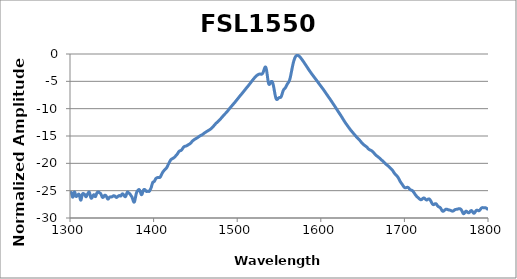
| Category | Normalized Amplitude (dB) |
|---|---|
| 1300.055786 | -25.632 |
| 1300.13855 | -25.602 |
| 1300.221313 | -25.572 |
| 1300.304199 | -25.54 |
| 1300.386963 | -25.508 |
| 1300.469849 | -25.476 |
| 1300.552734 | -25.446 |
| 1300.63562 | -25.418 |
| 1300.718506 | -25.392 |
| 1300.801392 | -25.369 |
| 1300.884277 | -25.35 |
| 1300.967163 | -25.335 |
| 1301.050049 | -25.324 |
| 1301.132935 | -25.319 |
| 1301.215942 | -25.319 |
| 1301.298828 | -25.324 |
| 1301.381836 | -25.335 |
| 1301.464844 | -25.351 |
| 1301.547852 | -25.373 |
| 1301.630859 | -25.401 |
| 1301.713867 | -25.434 |
| 1301.796875 | -25.471 |
| 1301.879883 | -25.513 |
| 1301.962891 | -25.559 |
| 1302.046021 | -25.608 |
| 1302.129028 | -25.66 |
| 1302.212158 | -25.713 |
| 1302.295166 | -25.768 |
| 1302.378296 | -25.823 |
| 1302.461304 | -25.877 |
| 1302.544434 | -25.929 |
| 1302.627563 | -25.979 |
| 1302.710693 | -26.025 |
| 1302.793823 | -26.067 |
| 1302.876953 | -26.103 |
| 1302.960205 | -26.134 |
| 1303.043335 | -26.158 |
| 1303.126465 | -26.175 |
| 1303.209839 | -26.185 |
| 1303.293091 | -26.187 |
| 1303.376343 | -26.181 |
| 1303.459473 | -26.168 |
| 1303.542725 | -26.148 |
| 1303.625977 | -26.121 |
| 1303.709229 | -26.087 |
| 1303.79248 | -26.047 |
| 1303.875854 | -26.003 |
| 1303.959106 | -25.954 |
| 1304.042358 | -25.902 |
| 1304.125732 | -25.847 |
| 1304.208984 | -25.79 |
| 1304.292358 | -25.732 |
| 1304.375732 | -25.675 |
| 1304.459106 | -25.618 |
| 1304.542358 | -25.563 |
| 1304.625732 | -25.511 |
| 1304.709229 | -25.462 |
| 1304.792603 | -25.416 |
| 1304.875977 | -25.375 |
| 1304.959473 | -25.339 |
| 1305.042847 | -25.309 |
| 1305.126343 | -25.284 |
| 1305.209839 | -25.265 |
| 1305.293213 | -25.253 |
| 1305.376709 | -25.247 |
| 1305.460205 | -25.248 |
| 1305.543701 | -25.256 |
| 1305.627197 | -25.27 |
| 1305.710693 | -25.29 |
| 1305.794189 | -25.317 |
| 1305.877808 | -25.349 |
| 1305.961304 | -25.386 |
| 1306.044922 | -25.427 |
| 1306.128418 | -25.473 |
| 1306.212036 | -25.521 |
| 1306.295654 | -25.572 |
| 1306.37915 | -25.625 |
| 1306.462769 | -25.677 |
| 1306.546387 | -25.73 |
| 1306.630005 | -25.78 |
| 1306.713745 | -25.829 |
| 1306.797485 | -25.874 |
| 1306.881104 | -25.916 |
| 1306.964722 | -25.953 |
| 1307.048462 | -25.985 |
| 1307.132202 | -26.012 |
| 1307.21582 | -26.033 |
| 1307.299561 | -26.048 |
| 1307.383301 | -26.059 |
| 1307.467041 | -26.064 |
| 1307.550781 | -26.065 |
| 1307.634521 | -26.062 |
| 1307.718262 | -26.055 |
| 1307.802124 | -26.046 |
| 1307.885864 | -26.035 |
| 1307.969727 | -26.022 |
| 1308.053467 | -26.008 |
| 1308.137329 | -25.994 |
| 1308.221191 | -25.98 |
| 1308.305054 | -25.966 |
| 1308.388916 | -25.953 |
| 1308.472778 | -25.941 |
| 1308.556641 | -25.929 |
| 1308.640625 | -25.918 |
| 1308.724487 | -25.908 |
| 1308.80835 | -25.898 |
| 1308.892334 | -25.887 |
| 1308.976196 | -25.877 |
| 1309.060181 | -25.866 |
| 1309.144165 | -25.854 |
| 1309.228027 | -25.841 |
| 1309.312012 | -25.827 |
| 1309.395996 | -25.812 |
| 1309.47998 | -25.796 |
| 1309.564087 | -25.779 |
| 1309.648071 | -25.761 |
| 1309.732056 | -25.742 |
| 1309.816162 | -25.724 |
| 1309.900146 | -25.705 |
| 1309.984253 | -25.688 |
| 1310.068359 | -25.672 |
| 1310.152466 | -25.658 |
| 1310.236572 | -25.646 |
| 1310.320679 | -25.637 |
| 1310.404785 | -25.632 |
| 1310.488892 | -25.63 |
| 1310.572998 | -25.633 |
| 1310.657227 | -25.641 |
| 1310.741333 | -25.653 |
| 1310.825562 | -25.671 |
| 1310.909668 | -25.693 |
| 1310.993896 | -25.721 |
| 1311.078125 | -25.754 |
| 1311.162354 | -25.792 |
| 1311.24646 | -25.835 |
| 1311.330811 | -25.882 |
| 1311.415039 | -25.933 |
| 1311.499268 | -25.987 |
| 1311.583496 | -26.045 |
| 1311.667847 | -26.105 |
| 1311.752075 | -26.166 |
| 1311.836426 | -26.228 |
| 1311.920776 | -26.291 |
| 1312.005127 | -26.352 |
| 1312.089478 | -26.412 |
| 1312.173706 | -26.469 |
| 1312.258057 | -26.523 |
| 1312.342529 | -26.572 |
| 1312.42688 | -26.615 |
| 1312.51123 | -26.653 |
| 1312.595581 | -26.684 |
| 1312.680054 | -26.708 |
| 1312.764404 | -26.724 |
| 1312.848877 | -26.732 |
| 1312.93335 | -26.731 |
| 1313.017822 | -26.722 |
| 1313.102295 | -26.705 |
| 1313.186768 | -26.68 |
| 1313.27124 | -26.648 |
| 1313.355713 | -26.609 |
| 1313.440186 | -26.564 |
| 1313.524658 | -26.514 |
| 1313.609375 | -26.459 |
| 1313.693848 | -26.401 |
| 1313.778442 | -26.34 |
| 1313.862915 | -26.277 |
| 1313.94751 | -26.213 |
| 1314.032104 | -26.15 |
| 1314.116699 | -26.087 |
| 1314.201416 | -26.026 |
| 1314.286011 | -25.967 |
| 1314.370605 | -25.91 |
| 1314.4552 | -25.856 |
| 1314.539917 | -25.806 |
| 1314.624512 | -25.76 |
| 1314.709229 | -25.718 |
| 1314.793945 | -25.68 |
| 1314.87854 | -25.646 |
| 1314.963257 | -25.617 |
| 1315.047974 | -25.592 |
| 1315.13269 | -25.57 |
| 1315.217407 | -25.553 |
| 1315.302246 | -25.539 |
| 1315.387085 | -25.529 |
| 1315.471802 | -25.522 |
| 1315.556641 | -25.518 |
| 1315.641357 | -25.516 |
| 1315.726196 | -25.517 |
| 1315.811035 | -25.519 |
| 1315.895752 | -25.522 |
| 1315.980591 | -25.527 |
| 1316.06543 | -25.533 |
| 1316.150391 | -25.539 |
| 1316.235229 | -25.546 |
| 1316.320068 | -25.552 |
| 1316.404907 | -25.56 |
| 1316.489868 | -25.567 |
| 1316.574707 | -25.574 |
| 1316.659668 | -25.582 |
| 1316.744629 | -25.589 |
| 1316.82959 | -25.598 |
| 1316.914551 | -25.606 |
| 1316.999512 | -25.616 |
| 1317.084473 | -25.627 |
| 1317.169556 | -25.639 |
| 1317.254517 | -25.652 |
| 1317.339478 | -25.667 |
| 1317.424561 | -25.683 |
| 1317.509521 | -25.702 |
| 1317.594604 | -25.722 |
| 1317.679688 | -25.744 |
| 1317.764771 | -25.767 |
| 1317.849731 | -25.792 |
| 1317.934814 | -25.819 |
| 1318.02002 | -25.846 |
| 1318.105103 | -25.875 |
| 1318.190186 | -25.903 |
| 1318.275269 | -25.932 |
| 1318.360474 | -25.96 |
| 1318.445557 | -25.987 |
| 1318.530762 | -26.012 |
| 1318.615967 | -26.035 |
| 1318.701172 | -26.056 |
| 1318.786255 | -26.075 |
| 1318.871582 | -26.09 |
| 1318.956787 | -26.101 |
| 1319.041992 | -26.108 |
| 1319.127319 | -26.112 |
| 1319.212524 | -26.112 |
| 1319.297852 | -26.107 |
| 1319.383057 | -26.099 |
| 1319.468384 | -26.087 |
| 1319.553589 | -26.071 |
| 1319.638916 | -26.052 |
| 1319.724243 | -26.031 |
| 1319.80957 | -26.007 |
| 1319.894897 | -25.981 |
| 1319.980225 | -25.953 |
| 1320.065674 | -25.924 |
| 1320.151001 | -25.895 |
| 1320.236328 | -25.865 |
| 1320.321777 | -25.835 |
| 1320.407227 | -25.806 |
| 1320.492554 | -25.777 |
| 1320.578003 | -25.748 |
| 1320.663574 | -25.721 |
| 1320.749023 | -25.694 |
| 1320.834473 | -25.668 |
| 1320.919922 | -25.643 |
| 1321.005371 | -25.619 |
| 1321.090942 | -25.595 |
| 1321.176392 | -25.572 |
| 1321.261841 | -25.549 |
| 1321.347412 | -25.526 |
| 1321.432983 | -25.504 |
| 1321.518555 | -25.481 |
| 1321.604004 | -25.458 |
| 1321.689575 | -25.436 |
| 1321.775269 | -25.413 |
| 1321.86084 | -25.391 |
| 1321.946411 | -25.37 |
| 1322.031982 | -25.349 |
| 1322.117676 | -25.329 |
| 1322.203247 | -25.311 |
| 1322.28894 | -25.294 |
| 1322.374634 | -25.28 |
| 1322.460327 | -25.269 |
| 1322.546021 | -25.261 |
| 1322.631714 | -25.256 |
| 1322.717407 | -25.255 |
| 1322.803101 | -25.259 |
| 1322.888794 | -25.266 |
| 1322.974609 | -25.279 |
| 1323.060303 | -25.296 |
| 1323.146118 | -25.318 |
| 1323.231812 | -25.344 |
| 1323.317627 | -25.375 |
| 1323.403442 | -25.411 |
| 1323.489258 | -25.45 |
| 1323.575073 | -25.493 |
| 1323.660889 | -25.54 |
| 1323.746704 | -25.589 |
| 1323.83252 | -25.641 |
| 1323.918457 | -25.695 |
| 1324.004272 | -25.75 |
| 1324.09021 | -25.805 |
| 1324.176147 | -25.861 |
| 1324.262085 | -25.917 |
| 1324.3479 | -25.971 |
| 1324.433838 | -26.023 |
| 1324.519775 | -26.074 |
| 1324.605713 | -26.122 |
| 1324.691772 | -26.166 |
| 1324.77771 | -26.208 |
| 1324.863647 | -26.245 |
| 1324.949707 | -26.279 |
| 1325.035645 | -26.308 |
| 1325.121704 | -26.333 |
| 1325.207764 | -26.353 |
| 1325.293823 | -26.369 |
| 1325.379883 | -26.381 |
| 1325.465942 | -26.388 |
| 1325.552002 | -26.391 |
| 1325.638062 | -26.39 |
| 1325.724121 | -26.386 |
| 1325.810303 | -26.378 |
| 1325.896362 | -26.368 |
| 1325.982666 | -26.354 |
| 1326.068726 | -26.338 |
| 1326.154907 | -26.32 |
| 1326.241089 | -26.299 |
| 1326.327271 | -26.277 |
| 1326.413452 | -26.254 |
| 1326.499634 | -26.229 |
| 1326.585815 | -26.203 |
| 1326.671997 | -26.177 |
| 1326.758301 | -26.149 |
| 1326.844482 | -26.121 |
| 1326.930786 | -26.093 |
| 1327.016968 | -26.064 |
| 1327.103271 | -26.036 |
| 1327.189575 | -26.008 |
| 1327.275879 | -25.98 |
| 1327.362183 | -25.952 |
| 1327.448486 | -25.925 |
| 1327.53479 | -25.899 |
| 1327.621094 | -25.875 |
| 1327.70752 | -25.852 |
| 1327.793945 | -25.83 |
| 1327.880249 | -25.811 |
| 1327.966675 | -25.794 |
| 1328.053101 | -25.779 |
| 1328.139526 | -25.767 |
| 1328.225952 | -25.757 |
| 1328.312378 | -25.751 |
| 1328.398804 | -25.748 |
| 1328.485229 | -25.748 |
| 1328.571655 | -25.751 |
| 1328.658203 | -25.757 |
| 1328.744629 | -25.767 |
| 1328.831177 | -25.78 |
| 1328.917603 | -25.796 |
| 1329.00415 | -25.814 |
| 1329.090698 | -25.835 |
| 1329.177246 | -25.858 |
| 1329.263794 | -25.882 |
| 1329.350342 | -25.908 |
| 1329.43689 | -25.934 |
| 1329.52356 | -25.96 |
| 1329.610229 | -25.985 |
| 1329.696777 | -26.009 |
| 1329.783447 | -26.031 |
| 1329.870117 | -26.05 |
| 1329.956665 | -26.067 |
| 1330.043335 | -26.079 |
| 1330.130005 | -26.087 |
| 1330.216675 | -26.091 |
| 1330.303345 | -26.09 |
| 1330.390137 | -26.084 |
| 1330.476807 | -26.073 |
| 1330.563477 | -26.058 |
| 1330.650269 | -26.037 |
| 1330.737061 | -26.013 |
| 1330.82373 | -25.984 |
| 1330.910522 | -25.952 |
| 1330.997314 | -25.918 |
| 1331.084106 | -25.881 |
| 1331.170898 | -25.843 |
| 1331.25769 | -25.803 |
| 1331.344604 | -25.764 |
| 1331.431396 | -25.724 |
| 1331.518311 | -25.685 |
| 1331.605103 | -25.646 |
| 1331.692017 | -25.609 |
| 1331.778931 | -25.574 |
| 1331.865845 | -25.54 |
| 1331.952759 | -25.507 |
| 1332.039673 | -25.477 |
| 1332.126587 | -25.449 |
| 1332.213501 | -25.423 |
| 1332.300415 | -25.399 |
| 1332.387329 | -25.376 |
| 1332.474365 | -25.356 |
| 1332.561279 | -25.337 |
| 1332.648315 | -25.32 |
| 1332.735352 | -25.305 |
| 1332.822388 | -25.291 |
| 1332.909424 | -25.279 |
| 1332.99646 | -25.268 |
| 1333.083496 | -25.258 |
| 1333.170654 | -25.25 |
| 1333.25769 | -25.243 |
| 1333.344727 | -25.237 |
| 1333.431885 | -25.233 |
| 1333.519043 | -25.23 |
| 1333.606079 | -25.228 |
| 1333.693237 | -25.227 |
| 1333.780396 | -25.227 |
| 1333.867554 | -25.228 |
| 1333.954712 | -25.23 |
| 1334.04187 | -25.233 |
| 1334.129028 | -25.236 |
| 1334.216309 | -25.241 |
| 1334.303467 | -25.247 |
| 1334.390747 | -25.254 |
| 1334.477905 | -25.261 |
| 1334.565186 | -25.27 |
| 1334.652466 | -25.279 |
| 1334.739746 | -25.289 |
| 1334.827026 | -25.299 |
| 1334.914307 | -25.311 |
| 1335.001587 | -25.322 |
| 1335.088989 | -25.335 |
| 1335.17627 | -25.347 |
| 1335.263672 | -25.36 |
| 1335.350952 | -25.373 |
| 1335.438354 | -25.386 |
| 1335.525635 | -25.399 |
| 1335.613037 | -25.411 |
| 1335.700439 | -25.424 |
| 1335.787842 | -25.436 |
| 1335.875244 | -25.448 |
| 1335.962769 | -25.459 |
| 1336.050171 | -25.471 |
| 1336.137573 | -25.482 |
| 1336.225098 | -25.494 |
| 1336.3125 | -25.506 |
| 1336.400024 | -25.518 |
| 1336.487549 | -25.531 |
| 1336.575073 | -25.545 |
| 1336.662598 | -25.56 |
| 1336.750244 | -25.577 |
| 1336.837769 | -25.595 |
| 1336.925293 | -25.614 |
| 1337.012939 | -25.636 |
| 1337.100464 | -25.659 |
| 1337.18811 | -25.684 |
| 1337.275635 | -25.711 |
| 1337.363281 | -25.74 |
| 1337.450928 | -25.77 |
| 1337.538574 | -25.802 |
| 1337.626221 | -25.835 |
| 1337.713867 | -25.868 |
| 1337.801514 | -25.902 |
| 1337.88916 | -25.936 |
| 1337.976929 | -25.97 |
| 1338.064575 | -26.003 |
| 1338.152344 | -26.035 |
| 1338.23999 | -26.065 |
| 1338.327759 | -26.094 |
| 1338.415527 | -26.12 |
| 1338.503296 | -26.144 |
| 1338.591187 | -26.166 |
| 1338.678955 | -26.184 |
| 1338.766724 | -26.2 |
| 1338.854492 | -26.213 |
| 1338.942383 | -26.223 |
| 1339.030151 | -26.231 |
| 1339.118042 | -26.235 |
| 1339.205811 | -26.237 |
| 1339.293701 | -26.237 |
| 1339.381592 | -26.234 |
| 1339.469482 | -26.229 |
| 1339.557373 | -26.222 |
| 1339.645264 | -26.213 |
| 1339.733154 | -26.203 |
| 1339.821167 | -26.191 |
| 1339.909058 | -26.177 |
| 1339.99707 | -26.162 |
| 1340.084961 | -26.147 |
| 1340.172974 | -26.13 |
| 1340.260986 | -26.112 |
| 1340.349121 | -26.093 |
| 1340.437134 | -26.074 |
| 1340.525146 | -26.054 |
| 1340.613159 | -26.033 |
| 1340.701172 | -26.013 |
| 1340.789307 | -25.992 |
| 1340.877319 | -25.972 |
| 1340.965454 | -25.952 |
| 1341.053467 | -25.934 |
| 1341.141602 | -25.916 |
| 1341.229736 | -25.899 |
| 1341.317871 | -25.884 |
| 1341.406006 | -25.871 |
| 1341.494141 | -25.859 |
| 1341.582275 | -25.85 |
| 1341.670532 | -25.842 |
| 1341.758667 | -25.837 |
| 1341.846924 | -25.834 |
| 1341.935059 | -25.833 |
| 1342.023315 | -25.834 |
| 1342.111572 | -25.837 |
| 1342.199829 | -25.842 |
| 1342.288086 | -25.848 |
| 1342.376343 | -25.856 |
| 1342.464722 | -25.865 |
| 1342.552979 | -25.875 |
| 1342.641235 | -25.886 |
| 1342.729614 | -25.898 |
| 1342.817871 | -25.911 |
| 1342.90625 | -25.925 |
| 1342.994629 | -25.939 |
| 1343.083008 | -25.954 |
| 1343.171387 | -25.97 |
| 1343.259766 | -25.987 |
| 1343.348145 | -26.005 |
| 1343.436523 | -26.024 |
| 1343.524902 | -26.044 |
| 1343.613403 | -26.066 |
| 1343.701782 | -26.09 |
| 1343.790283 | -26.115 |
| 1343.878784 | -26.141 |
| 1343.967285 | -26.169 |
| 1344.055786 | -26.198 |
| 1344.144287 | -26.229 |
| 1344.232788 | -26.26 |
| 1344.321289 | -26.292 |
| 1344.409912 | -26.323 |
| 1344.498413 | -26.354 |
| 1344.587036 | -26.385 |
| 1344.675537 | -26.414 |
| 1344.76416 | -26.441 |
| 1344.852783 | -26.466 |
| 1344.941284 | -26.488 |
| 1345.029907 | -26.506 |
| 1345.11853 | -26.522 |
| 1345.207275 | -26.534 |
| 1345.295898 | -26.542 |
| 1345.384521 | -26.546 |
| 1345.473267 | -26.547 |
| 1345.56189 | -26.543 |
| 1345.650635 | -26.537 |
| 1345.73938 | -26.527 |
| 1345.828125 | -26.514 |
| 1345.91687 | -26.499 |
| 1346.005615 | -26.481 |
| 1346.09436 | -26.462 |
| 1346.183105 | -26.441 |
| 1346.271973 | -26.42 |
| 1346.360718 | -26.398 |
| 1346.449463 | -26.375 |
| 1346.53833 | -26.353 |
| 1346.627197 | -26.332 |
| 1346.716064 | -26.311 |
| 1346.80481 | -26.291 |
| 1346.893677 | -26.272 |
| 1346.982544 | -26.254 |
| 1347.071533 | -26.238 |
| 1347.1604 | -26.223 |
| 1347.249268 | -26.21 |
| 1347.338257 | -26.198 |
| 1347.427124 | -26.188 |
| 1347.516113 | -26.179 |
| 1347.605103 | -26.172 |
| 1347.694092 | -26.165 |
| 1347.783081 | -26.16 |
| 1347.87207 | -26.155 |
| 1347.96106 | -26.151 |
| 1348.050171 | -26.148 |
| 1348.139282 | -26.146 |
| 1348.228271 | -26.143 |
| 1348.317261 | -26.141 |
| 1348.406372 | -26.14 |
| 1348.495483 | -26.138 |
| 1348.584595 | -26.137 |
| 1348.673584 | -26.136 |
| 1348.762695 | -26.135 |
| 1348.851929 | -26.134 |
| 1348.94104 | -26.134 |
| 1349.030151 | -26.134 |
| 1349.119263 | -26.134 |
| 1349.208496 | -26.135 |
| 1349.297607 | -26.135 |
| 1349.386841 | -26.136 |
| 1349.476196 | -26.137 |
| 1349.565308 | -26.139 |
| 1349.654541 | -26.139 |
| 1349.743774 | -26.14 |
| 1349.83313 | -26.14 |
| 1349.922363 | -26.14 |
| 1350.011597 | -26.138 |
| 1350.100952 | -26.136 |
| 1350.190186 | -26.132 |
| 1350.279541 | -26.128 |
| 1350.368896 | -26.122 |
| 1350.45813 | -26.114 |
| 1350.547485 | -26.106 |
| 1350.636841 | -26.096 |
| 1350.726196 | -26.085 |
| 1350.815674 | -26.074 |
| 1350.905029 | -26.061 |
| 1350.994385 | -26.049 |
| 1351.083862 | -26.036 |
| 1351.17334 | -26.023 |
| 1351.262695 | -26.011 |
| 1351.352295 | -25.999 |
| 1351.441772 | -25.988 |
| 1351.53125 | -25.978 |
| 1351.620728 | -25.969 |
| 1351.710205 | -25.961 |
| 1351.799683 | -25.955 |
| 1351.889282 | -25.949 |
| 1351.97876 | -25.945 |
| 1352.068359 | -25.942 |
| 1352.157837 | -25.941 |
| 1352.247437 | -25.94 |
| 1352.337036 | -25.94 |
| 1352.426636 | -25.94 |
| 1352.516235 | -25.941 |
| 1352.605835 | -25.943 |
| 1352.695435 | -25.945 |
| 1352.785156 | -25.948 |
| 1352.874756 | -25.951 |
| 1352.964478 | -25.954 |
| 1353.054077 | -25.958 |
| 1353.143799 | -25.962 |
| 1353.233643 | -25.966 |
| 1353.323364 | -25.972 |
| 1353.413086 | -25.977 |
| 1353.502808 | -25.984 |
| 1353.592529 | -25.991 |
| 1353.682251 | -25.999 |
| 1353.772095 | -26.009 |
| 1353.861816 | -26.019 |
| 1353.95166 | -26.03 |
| 1354.041504 | -26.041 |
| 1354.131226 | -26.054 |
| 1354.221069 | -26.068 |
| 1354.310913 | -26.082 |
| 1354.400879 | -26.096 |
| 1354.490723 | -26.111 |
| 1354.580566 | -26.125 |
| 1354.67041 | -26.14 |
| 1354.760376 | -26.154 |
| 1354.850342 | -26.168 |
| 1354.940186 | -26.181 |
| 1355.030273 | -26.193 |
| 1355.120239 | -26.203 |
| 1355.210205 | -26.213 |
| 1355.300171 | -26.22 |
| 1355.390137 | -26.226 |
| 1355.480103 | -26.231 |
| 1355.57019 | -26.234 |
| 1355.660156 | -26.235 |
| 1355.750244 | -26.234 |
| 1355.84021 | -26.231 |
| 1355.930298 | -26.227 |
| 1356.020386 | -26.222 |
| 1356.110474 | -26.215 |
| 1356.200562 | -26.206 |
| 1356.290649 | -26.197 |
| 1356.380737 | -26.187 |
| 1356.470947 | -26.176 |
| 1356.561035 | -26.164 |
| 1356.651245 | -26.151 |
| 1356.741333 | -26.138 |
| 1356.831543 | -26.125 |
| 1356.921875 | -26.112 |
| 1357.012085 | -26.098 |
| 1357.102295 | -26.085 |
| 1357.192505 | -26.071 |
| 1357.282715 | -26.058 |
| 1357.373047 | -26.045 |
| 1357.463257 | -26.032 |
| 1357.553467 | -26.019 |
| 1357.643799 | -26.007 |
| 1357.734131 | -25.995 |
| 1357.824463 | -25.983 |
| 1357.914795 | -25.972 |
| 1358.005127 | -25.961 |
| 1358.095459 | -25.951 |
| 1358.185791 | -25.942 |
| 1358.276123 | -25.933 |
| 1358.366577 | -25.925 |
| 1358.456909 | -25.918 |
| 1358.547363 | -25.912 |
| 1358.637817 | -25.907 |
| 1358.728271 | -25.904 |
| 1358.818726 | -25.902 |
| 1358.90918 | -25.901 |
| 1358.999634 | -25.902 |
| 1359.090088 | -25.904 |
| 1359.180664 | -25.908 |
| 1359.271118 | -25.913 |
| 1359.361694 | -25.919 |
| 1359.452148 | -25.926 |
| 1359.542725 | -25.934 |
| 1359.633301 | -25.943 |
| 1359.723877 | -25.952 |
| 1359.814453 | -25.961 |
| 1359.905151 | -25.97 |
| 1359.995728 | -25.978 |
| 1360.086304 | -25.986 |
| 1360.17688 | -25.991 |
| 1360.267578 | -25.995 |
| 1360.358276 | -25.997 |
| 1360.448853 | -25.997 |
| 1360.539551 | -25.993 |
| 1360.630371 | -25.988 |
| 1360.721069 | -25.979 |
| 1360.811768 | -25.967 |
| 1360.902466 | -25.953 |
| 1360.993164 | -25.936 |
| 1361.083984 | -25.917 |
| 1361.174683 | -25.895 |
| 1361.265503 | -25.872 |
| 1361.356201 | -25.848 |
| 1361.447021 | -25.823 |
| 1361.537842 | -25.797 |
| 1361.628662 | -25.771 |
| 1361.719482 | -25.746 |
| 1361.810303 | -25.722 |
| 1361.901245 | -25.698 |
| 1361.992065 | -25.677 |
| 1362.083008 | -25.657 |
| 1362.173828 | -25.639 |
| 1362.264771 | -25.624 |
| 1362.355713 | -25.611 |
| 1362.446533 | -25.6 |
| 1362.537598 | -25.592 |
| 1362.62854 | -25.587 |
| 1362.719482 | -25.584 |
| 1362.810547 | -25.583 |
| 1362.901489 | -25.585 |
| 1362.992554 | -25.588 |
| 1363.083496 | -25.594 |
| 1363.174561 | -25.601 |
| 1363.265625 | -25.61 |
| 1363.356567 | -25.62 |
| 1363.447632 | -25.632 |
| 1363.538818 | -25.645 |
| 1363.629883 | -25.659 |
| 1363.720947 | -25.674 |
| 1363.812012 | -25.69 |
| 1363.903198 | -25.707 |
| 1363.994263 | -25.725 |
| 1364.085449 | -25.743 |
| 1364.176636 | -25.762 |
| 1364.267822 | -25.782 |
| 1364.359009 | -25.803 |
| 1364.450195 | -25.824 |
| 1364.541504 | -25.845 |
| 1364.63269 | -25.867 |
| 1364.723877 | -25.889 |
| 1364.815186 | -25.911 |
| 1364.906372 | -25.932 |
| 1364.997681 | -25.954 |
| 1365.088989 | -25.975 |
| 1365.180298 | -25.995 |
| 1365.271606 | -26.014 |
| 1365.362915 | -26.032 |
| 1365.454224 | -26.048 |
| 1365.545532 | -26.063 |
| 1365.636963 | -26.076 |
| 1365.728271 | -26.087 |
| 1365.819702 | -26.095 |
| 1365.911011 | -26.1 |
| 1366.002441 | -26.103 |
| 1366.093872 | -26.103 |
| 1366.185303 | -26.099 |
| 1366.276855 | -26.092 |
| 1366.368286 | -26.082 |
| 1366.459717 | -26.067 |
| 1366.551147 | -26.05 |
| 1366.6427 | -26.028 |
| 1366.734253 | -26.003 |
| 1366.825684 | -25.975 |
| 1366.917236 | -25.943 |
| 1367.008789 | -25.908 |
| 1367.100342 | -25.871 |
| 1367.191895 | -25.831 |
| 1367.283447 | -25.789 |
| 1367.375 | -25.745 |
| 1367.466675 | -25.701 |
| 1367.558228 | -25.656 |
| 1367.649902 | -25.611 |
| 1367.741577 | -25.566 |
| 1367.83313 | -25.523 |
| 1367.924805 | -25.481 |
| 1368.016479 | -25.442 |
| 1368.108276 | -25.405 |
| 1368.199951 | -25.372 |
| 1368.291626 | -25.342 |
| 1368.383423 | -25.315 |
| 1368.475098 | -25.293 |
| 1368.566895 | -25.274 |
| 1368.658691 | -25.26 |
| 1368.750366 | -25.249 |
| 1368.842163 | -25.243 |
| 1368.93396 | -25.24 |
| 1369.025757 | -25.241 |
| 1369.117676 | -25.246 |
| 1369.209473 | -25.253 |
| 1369.30127 | -25.262 |
| 1369.393188 | -25.274 |
| 1369.484985 | -25.288 |
| 1369.576904 | -25.302 |
| 1369.668823 | -25.318 |
| 1369.760742 | -25.334 |
| 1369.852661 | -25.35 |
| 1369.94458 | -25.366 |
| 1370.036621 | -25.382 |
| 1370.12854 | -25.397 |
| 1370.220459 | -25.411 |
| 1370.3125 | -25.424 |
| 1370.404541 | -25.437 |
| 1370.49646 | -25.448 |
| 1370.588501 | -25.459 |
| 1370.680542 | -25.47 |
| 1370.772583 | -25.48 |
| 1370.864624 | -25.49 |
| 1370.956665 | -25.5 |
| 1371.048828 | -25.51 |
| 1371.140869 | -25.521 |
| 1371.233032 | -25.533 |
| 1371.325073 | -25.546 |
| 1371.417236 | -25.559 |
| 1371.509399 | -25.574 |
| 1371.601563 | -25.59 |
| 1371.693726 | -25.606 |
| 1371.786011 | -25.624 |
| 1371.878174 | -25.643 |
| 1371.970459 | -25.663 |
| 1372.062622 | -25.683 |
| 1372.154907 | -25.704 |
| 1372.247192 | -25.725 |
| 1372.339355 | -25.747 |
| 1372.431641 | -25.769 |
| 1372.523926 | -25.79 |
| 1372.616211 | -25.812 |
| 1372.708496 | -25.833 |
| 1372.800781 | -25.855 |
| 1372.893188 | -25.875 |
| 1372.985474 | -25.896 |
| 1373.077881 | -25.916 |
| 1373.170166 | -25.937 |
| 1373.262573 | -25.957 |
| 1373.35498 | -25.978 |
| 1373.447388 | -25.999 |
| 1373.539795 | -26.021 |
| 1373.632202 | -26.043 |
| 1373.724609 | -26.066 |
| 1373.817261 | -26.091 |
| 1373.909668 | -26.116 |
| 1374.002197 | -26.144 |
| 1374.094604 | -26.172 |
| 1374.187134 | -26.203 |
| 1374.279663 | -26.235 |
| 1374.372192 | -26.269 |
| 1374.464722 | -26.305 |
| 1374.557251 | -26.343 |
| 1374.64978 | -26.383 |
| 1374.742432 | -26.424 |
| 1374.834961 | -26.467 |
| 1374.927612 | -26.511 |
| 1375.020264 | -26.556 |
| 1375.112793 | -26.602 |
| 1375.205444 | -26.648 |
| 1375.298096 | -26.694 |
| 1375.390747 | -26.74 |
| 1375.483521 | -26.785 |
| 1375.576172 | -26.829 |
| 1375.668823 | -26.871 |
| 1375.761719 | -26.911 |
| 1375.85437 | -26.948 |
| 1375.947144 | -26.982 |
| 1376.039917 | -27.013 |
| 1376.13269 | -27.039 |
| 1376.225464 | -27.061 |
| 1376.318237 | -27.078 |
| 1376.411011 | -27.09 |
| 1376.503784 | -27.097 |
| 1376.59668 | -27.099 |
| 1376.689453 | -27.094 |
| 1376.782349 | -27.085 |
| 1376.875244 | -27.069 |
| 1376.96814 | -27.048 |
| 1377.061035 | -27.021 |
| 1377.153931 | -26.989 |
| 1377.246826 | -26.952 |
| 1377.339722 | -26.91 |
| 1377.432617 | -26.862 |
| 1377.525635 | -26.81 |
| 1377.618652 | -26.754 |
| 1377.71167 | -26.694 |
| 1377.804688 | -26.631 |
| 1377.897583 | -26.564 |
| 1377.990601 | -26.495 |
| 1378.083618 | -26.423 |
| 1378.176758 | -26.35 |
| 1378.269775 | -26.276 |
| 1378.362793 | -26.2 |
| 1378.455933 | -26.125 |
| 1378.54895 | -26.051 |
| 1378.64209 | -25.977 |
| 1378.735229 | -25.904 |
| 1378.828369 | -25.834 |
| 1378.921509 | -25.766 |
| 1379.014648 | -25.7 |
| 1379.107788 | -25.637 |
| 1379.200928 | -25.578 |
| 1379.294189 | -25.522 |
| 1379.387329 | -25.469 |
| 1379.480591 | -25.421 |
| 1379.573853 | -25.375 |
| 1379.667114 | -25.334 |
| 1379.760376 | -25.296 |
| 1379.853638 | -25.261 |
| 1379.946899 | -25.229 |
| 1380.040283 | -25.2 |
| 1380.133545 | -25.174 |
| 1380.226807 | -25.15 |
| 1380.32019 | -25.127 |
| 1380.413574 | -25.107 |
| 1380.506836 | -25.088 |
| 1380.60022 | -25.069 |
| 1380.693604 | -25.052 |
| 1380.786987 | -25.035 |
| 1380.880371 | -25.018 |
| 1380.973877 | -25.001 |
| 1381.067261 | -24.984 |
| 1381.160767 | -24.968 |
| 1381.25415 | -24.951 |
| 1381.347656 | -24.935 |
| 1381.441162 | -24.918 |
| 1381.534668 | -24.902 |
| 1381.628174 | -24.887 |
| 1381.72168 | -24.871 |
| 1381.815308 | -24.857 |
| 1381.908813 | -24.844 |
| 1382.002319 | -24.832 |
| 1382.095947 | -24.822 |
| 1382.189453 | -24.813 |
| 1382.283081 | -24.806 |
| 1382.376709 | -24.801 |
| 1382.470337 | -24.799 |
| 1382.563965 | -24.799 |
| 1382.657593 | -24.802 |
| 1382.751221 | -24.807 |
| 1382.844971 | -24.816 |
| 1382.938599 | -24.827 |
| 1383.032349 | -24.841 |
| 1383.125977 | -24.859 |
| 1383.219727 | -24.88 |
| 1383.313477 | -24.903 |
| 1383.407349 | -24.93 |
| 1383.501099 | -24.96 |
| 1383.594849 | -24.992 |
| 1383.688721 | -25.028 |
| 1383.782593 | -25.065 |
| 1383.876343 | -25.105 |
| 1383.970215 | -25.146 |
| 1384.063965 | -25.19 |
| 1384.157837 | -25.234 |
| 1384.251709 | -25.279 |
| 1384.345581 | -25.325 |
| 1384.439453 | -25.37 |
| 1384.533325 | -25.415 |
| 1384.627319 | -25.459 |
| 1384.721191 | -25.501 |
| 1384.815186 | -25.542 |
| 1384.909058 | -25.579 |
| 1385.003052 | -25.614 |
| 1385.097046 | -25.645 |
| 1385.19104 | -25.672 |
| 1385.285034 | -25.695 |
| 1385.37915 | -25.713 |
| 1385.473145 | -25.725 |
| 1385.567261 | -25.733 |
| 1385.661255 | -25.734 |
| 1385.755371 | -25.73 |
| 1385.849365 | -25.721 |
| 1385.943481 | -25.705 |
| 1386.037598 | -25.685 |
| 1386.131714 | -25.659 |
| 1386.22583 | -25.628 |
| 1386.319946 | -25.594 |
| 1386.414185 | -25.555 |
| 1386.508301 | -25.513 |
| 1386.602539 | -25.468 |
| 1386.696655 | -25.422 |
| 1386.790894 | -25.374 |
| 1386.885132 | -25.325 |
| 1386.97937 | -25.276 |
| 1387.073608 | -25.228 |
| 1387.167847 | -25.181 |
| 1387.262207 | -25.135 |
| 1387.356445 | -25.091 |
| 1387.450806 | -25.05 |
| 1387.545044 | -25.011 |
| 1387.639404 | -24.976 |
| 1387.733765 | -24.943 |
| 1387.828125 | -24.913 |
| 1387.922485 | -24.887 |
| 1388.016846 | -24.863 |
| 1388.111206 | -24.843 |
| 1388.205566 | -24.826 |
| 1388.300049 | -24.812 |
| 1388.394409 | -24.8 |
| 1388.488892 | -24.791 |
| 1388.583374 | -24.785 |
| 1388.677734 | -24.781 |
| 1388.772217 | -24.779 |
| 1388.866699 | -24.778 |
| 1388.961304 | -24.78 |
| 1389.055786 | -24.783 |
| 1389.150269 | -24.787 |
| 1389.244873 | -24.793 |
| 1389.339478 | -24.801 |
| 1389.434082 | -24.809 |
| 1389.528687 | -24.819 |
| 1389.623169 | -24.83 |
| 1389.717773 | -24.842 |
| 1389.8125 | -24.855 |
| 1389.907104 | -24.869 |
| 1390.001709 | -24.884 |
| 1390.096313 | -24.9 |
| 1390.19104 | -24.916 |
| 1390.285767 | -24.934 |
| 1390.380371 | -24.952 |
| 1390.475098 | -24.97 |
| 1390.569824 | -24.988 |
| 1390.664551 | -25.007 |
| 1390.759277 | -25.025 |
| 1390.854126 | -25.043 |
| 1390.948853 | -25.06 |
| 1391.043579 | -25.076 |
| 1391.13855 | -25.091 |
| 1391.233276 | -25.105 |
| 1391.328125 | -25.117 |
| 1391.422974 | -25.128 |
| 1391.517822 | -25.137 |
| 1391.612671 | -25.144 |
| 1391.707642 | -25.149 |
| 1391.80249 | -25.152 |
| 1391.897339 | -25.153 |
| 1391.99231 | -25.152 |
| 1392.087158 | -25.149 |
| 1392.182129 | -25.145 |
| 1392.2771 | -25.14 |
| 1392.37207 | -25.134 |
| 1392.467041 | -25.127 |
| 1392.562012 | -25.12 |
| 1392.657104 | -25.113 |
| 1392.752075 | -25.106 |
| 1392.847046 | -25.1 |
| 1392.942139 | -25.094 |
| 1393.037231 | -25.09 |
| 1393.132324 | -25.087 |
| 1393.227417 | -25.085 |
| 1393.32251 | -25.085 |
| 1393.417603 | -25.087 |
| 1393.512817 | -25.09 |
| 1393.60791 | -25.094 |
| 1393.703003 | -25.099 |
| 1393.798218 | -25.105 |
| 1393.893433 | -25.112 |
| 1393.988525 | -25.119 |
| 1394.08374 | -25.125 |
| 1394.178955 | -25.131 |
| 1394.27417 | -25.136 |
| 1394.369507 | -25.139 |
| 1394.464722 | -25.14 |
| 1394.559937 | -25.139 |
| 1394.655273 | -25.135 |
| 1394.750488 | -25.128 |
| 1394.845825 | -25.118 |
| 1394.941162 | -25.105 |
| 1395.036621 | -25.089 |
| 1395.131958 | -25.071 |
| 1395.227295 | -25.049 |
| 1395.322632 | -25.025 |
| 1395.417969 | -24.999 |
| 1395.513428 | -24.971 |
| 1395.608887 | -24.942 |
| 1395.704224 | -24.911 |
| 1395.799683 | -24.881 |
| 1395.895142 | -24.849 |
| 1395.990723 | -24.818 |
| 1396.086182 | -24.786 |
| 1396.181641 | -24.755 |
| 1396.2771 | -24.723 |
| 1396.372681 | -24.692 |
| 1396.46814 | -24.66 |
| 1396.563721 | -24.628 |
| 1396.659302 | -24.595 |
| 1396.754883 | -24.562 |
| 1396.850464 | -24.526 |
| 1396.946045 | -24.489 |
| 1397.041748 | -24.451 |
| 1397.137329 | -24.41 |
| 1397.23291 | -24.366 |
| 1397.328613 | -24.321 |
| 1397.424194 | -24.273 |
| 1397.519897 | -24.223 |
| 1397.615601 | -24.171 |
| 1397.711304 | -24.118 |
| 1397.807007 | -24.063 |
| 1397.90271 | -24.008 |
| 1397.998413 | -23.953 |
| 1398.094238 | -23.898 |
| 1398.189941 | -23.844 |
| 1398.285767 | -23.792 |
| 1398.381592 | -23.742 |
| 1398.477295 | -23.695 |
| 1398.57312 | -23.65 |
| 1398.668945 | -23.609 |
| 1398.764771 | -23.572 |
| 1398.860718 | -23.538 |
| 1398.956665 | -23.509 |
| 1399.05249 | -23.483 |
| 1399.148438 | -23.461 |
| 1399.244263 | -23.443 |
| 1399.34021 | -23.428 |
| 1399.436157 | -23.416 |
| 1399.532104 | -23.407 |
| 1399.628052 | -23.399 |
| 1399.723999 | -23.394 |
| 1399.820068 | -23.389 |
| 1399.916016 | -23.385 |
| 1400.011963 | -23.382 |
| 1400.108032 | -23.378 |
| 1400.204102 | -23.373 |
| 1400.300171 | -23.367 |
| 1400.39624 | -23.36 |
| 1400.49231 | -23.35 |
| 1400.588379 | -23.339 |
| 1400.684448 | -23.325 |
| 1400.78064 | -23.309 |
| 1400.876709 | -23.29 |
| 1400.9729 | -23.269 |
| 1401.069092 | -23.246 |
| 1401.165283 | -23.221 |
| 1401.261475 | -23.194 |
| 1401.357666 | -23.166 |
| 1401.453857 | -23.136 |
| 1401.550049 | -23.106 |
| 1401.646362 | -23.075 |
| 1401.742554 | -23.043 |
| 1401.838867 | -23.012 |
| 1401.935059 | -22.981 |
| 1402.031372 | -22.951 |
| 1402.127686 | -22.922 |
| 1402.223999 | -22.894 |
| 1402.320313 | -22.868 |
| 1402.416626 | -22.843 |
| 1402.513062 | -22.82 |
| 1402.609375 | -22.799 |
| 1402.705811 | -22.779 |
| 1402.802124 | -22.762 |
| 1402.89856 | -22.746 |
| 1402.995117 | -22.732 |
| 1403.091553 | -22.719 |
| 1403.187988 | -22.708 |
| 1403.284424 | -22.698 |
| 1403.380859 | -22.69 |
| 1403.477417 | -22.682 |
| 1403.573853 | -22.675 |
| 1403.67041 | -22.669 |
| 1403.766968 | -22.664 |
| 1403.863525 | -22.658 |
| 1403.960083 | -22.653 |
| 1404.056641 | -22.648 |
| 1404.153198 | -22.643 |
| 1404.249756 | -22.638 |
| 1404.346313 | -22.633 |
| 1404.442993 | -22.628 |
| 1404.539673 | -22.622 |
| 1404.63623 | -22.617 |
| 1404.73291 | -22.612 |
| 1404.82959 | -22.607 |
| 1404.926392 | -22.602 |
| 1405.023071 | -22.598 |
| 1405.119751 | -22.594 |
| 1405.216553 | -22.591 |
| 1405.313232 | -22.588 |
| 1405.410034 | -22.586 |
| 1405.506836 | -22.584 |
| 1405.603516 | -22.583 |
| 1405.700317 | -22.583 |
| 1405.797119 | -22.584 |
| 1405.893921 | -22.585 |
| 1405.990845 | -22.586 |
| 1406.087646 | -22.588 |
| 1406.18457 | -22.59 |
| 1406.281372 | -22.593 |
| 1406.378296 | -22.595 |
| 1406.47522 | -22.597 |
| 1406.572144 | -22.599 |
| 1406.669067 | -22.6 |
| 1406.765991 | -22.601 |
| 1406.862915 | -22.6 |
| 1406.959961 | -22.599 |
| 1407.056885 | -22.597 |
| 1407.153931 | -22.593 |
| 1407.250977 | -22.588 |
| 1407.348022 | -22.581 |
| 1407.444946 | -22.573 |
| 1407.541992 | -22.563 |
| 1407.63916 | -22.551 |
| 1407.736206 | -22.538 |
| 1407.833252 | -22.522 |
| 1407.93042 | -22.505 |
| 1408.027466 | -22.487 |
| 1408.124634 | -22.466 |
| 1408.221802 | -22.444 |
| 1408.318848 | -22.42 |
| 1408.416016 | -22.394 |
| 1408.513306 | -22.367 |
| 1408.610474 | -22.339 |
| 1408.707764 | -22.309 |
| 1408.804932 | -22.279 |
| 1408.902344 | -22.247 |
| 1408.999512 | -22.215 |
| 1409.096802 | -22.182 |
| 1409.194092 | -22.148 |
| 1409.291382 | -22.115 |
| 1409.388672 | -22.081 |
| 1409.485962 | -22.047 |
| 1409.583252 | -22.014 |
| 1409.680664 | -21.981 |
| 1409.777954 | -21.948 |
| 1409.875366 | -21.916 |
| 1409.972778 | -21.885 |
| 1410.07019 | -21.854 |
| 1410.167603 | -21.825 |
| 1410.265015 | -21.796 |
| 1410.362427 | -21.768 |
| 1410.459839 | -21.742 |
| 1410.557373 | -21.716 |
| 1410.654785 | -21.692 |
| 1410.752319 | -21.668 |
| 1410.849854 | -21.645 |
| 1410.947388 | -21.623 |
| 1411.044922 | -21.602 |
| 1411.142456 | -21.581 |
| 1411.23999 | -21.561 |
| 1411.337646 | -21.541 |
| 1411.435181 | -21.522 |
| 1411.532837 | -21.503 |
| 1411.630371 | -21.484 |
| 1411.728027 | -21.465 |
| 1411.825684 | -21.446 |
| 1411.92334 | -21.427 |
| 1412.020996 | -21.408 |
| 1412.118652 | -21.389 |
| 1412.216309 | -21.37 |
| 1412.314087 | -21.35 |
| 1412.411743 | -21.331 |
| 1412.509521 | -21.312 |
| 1412.6073 | -21.293 |
| 1412.704956 | -21.275 |
| 1412.802734 | -21.256 |
| 1412.900635 | -21.238 |
| 1412.998413 | -21.221 |
| 1413.096313 | -21.204 |
| 1413.194092 | -21.187 |
| 1413.291992 | -21.171 |
| 1413.389771 | -21.156 |
| 1413.487671 | -21.141 |
| 1413.585571 | -21.127 |
| 1413.683472 | -21.113 |
| 1413.781372 | -21.1 |
| 1413.879272 | -21.087 |
| 1413.977173 | -21.075 |
| 1414.075195 | -21.062 |
| 1414.173096 | -21.05 |
| 1414.271118 | -21.037 |
| 1414.369141 | -21.024 |
| 1414.467041 | -21.011 |
| 1414.565063 | -20.998 |
| 1414.663086 | -20.984 |
| 1414.76123 | -20.969 |
| 1414.859253 | -20.954 |
| 1414.957397 | -20.937 |
| 1415.055542 | -20.92 |
| 1415.153564 | -20.901 |
| 1415.251709 | -20.882 |
| 1415.349854 | -20.861 |
| 1415.447998 | -20.84 |
| 1415.546143 | -20.817 |
| 1415.644287 | -20.793 |
| 1415.742432 | -20.768 |
| 1415.840698 | -20.741 |
| 1415.938843 | -20.714 |
| 1416.037109 | -20.686 |
| 1416.135376 | -20.657 |
| 1416.233643 | -20.627 |
| 1416.331909 | -20.596 |
| 1416.430176 | -20.565 |
| 1416.528442 | -20.533 |
| 1416.626709 | -20.501 |
| 1416.724976 | -20.469 |
| 1416.823364 | -20.437 |
| 1416.921753 | -20.405 |
| 1417.020142 | -20.373 |
| 1417.11853 | -20.341 |
| 1417.216919 | -20.31 |
| 1417.315308 | -20.279 |
| 1417.413696 | -20.248 |
| 1417.512207 | -20.217 |
| 1417.610596 | -20.187 |
| 1417.709106 | -20.157 |
| 1417.807495 | -20.127 |
| 1417.906006 | -20.097 |
| 1418.004517 | -20.068 |
| 1418.103027 | -20.038 |
| 1418.201538 | -20.009 |
| 1418.300049 | -19.979 |
| 1418.39856 | -19.949 |
| 1418.497192 | -19.919 |
| 1418.595703 | -19.889 |
| 1418.694336 | -19.858 |
| 1418.792969 | -19.828 |
| 1418.891602 | -19.797 |
| 1418.990234 | -19.767 |
| 1419.088989 | -19.736 |
| 1419.187622 | -19.706 |
| 1419.286255 | -19.676 |
| 1419.38501 | -19.646 |
| 1419.483643 | -19.617 |
| 1419.582397 | -19.589 |
| 1419.68103 | -19.561 |
| 1419.779785 | -19.535 |
| 1419.87854 | -19.509 |
| 1419.977295 | -19.484 |
| 1420.076172 | -19.46 |
| 1420.174927 | -19.437 |
| 1420.273804 | -19.416 |
| 1420.372559 | -19.395 |
| 1420.471436 | -19.376 |
| 1420.570313 | -19.358 |
| 1420.669067 | -19.34 |
| 1420.767944 | -19.324 |
| 1420.866943 | -19.309 |
| 1420.965942 | -19.294 |
| 1421.064819 | -19.281 |
| 1421.163696 | -19.268 |
| 1421.262817 | -19.256 |
| 1421.361816 | -19.244 |
| 1421.460693 | -19.234 |
| 1421.559692 | -19.223 |
| 1421.658691 | -19.214 |
| 1421.75769 | -19.204 |
| 1421.856812 | -19.196 |
| 1421.955811 | -19.187 |
| 1422.054932 | -19.179 |
| 1422.153931 | -19.171 |
| 1422.253052 | -19.163 |
| 1422.352173 | -19.155 |
| 1422.451294 | -19.148 |
| 1422.550415 | -19.14 |
| 1422.649536 | -19.132 |
| 1422.748657 | -19.124 |
| 1422.847778 | -19.116 |
| 1422.947021 | -19.108 |
| 1423.046265 | -19.1 |
| 1423.145508 | -19.091 |
| 1423.244751 | -19.082 |
| 1423.343994 | -19.073 |
| 1423.443237 | -19.063 |
| 1423.54248 | -19.053 |
| 1423.641724 | -19.043 |
| 1423.741089 | -19.032 |
| 1423.840332 | -19.021 |
| 1423.939697 | -19.01 |
| 1424.039063 | -18.998 |
| 1424.138428 | -18.986 |
| 1424.237793 | -18.973 |
| 1424.337158 | -18.961 |
| 1424.436523 | -18.948 |
| 1424.535889 | -18.935 |
| 1424.635376 | -18.921 |
| 1424.734741 | -18.907 |
| 1424.834229 | -18.893 |
| 1424.933716 | -18.879 |
| 1425.033203 | -18.865 |
| 1425.13269 | -18.85 |
| 1425.232178 | -18.835 |
| 1425.331787 | -18.82 |
| 1425.431274 | -18.805 |
| 1425.530762 | -18.789 |
| 1425.630371 | -18.774 |
| 1425.72998 | -18.758 |
| 1425.829468 | -18.742 |
| 1425.929077 | -18.726 |
| 1426.028687 | -18.71 |
| 1426.128418 | -18.694 |
| 1426.228027 | -18.678 |
| 1426.327637 | -18.662 |
| 1426.427368 | -18.646 |
| 1426.526978 | -18.629 |
| 1426.626709 | -18.613 |
| 1426.72644 | -18.597 |
| 1426.826172 | -18.58 |
| 1426.925903 | -18.564 |
| 1427.025635 | -18.548 |
| 1427.125488 | -18.531 |
| 1427.22522 | -18.514 |
| 1427.325073 | -18.497 |
| 1427.424805 | -18.48 |
| 1427.524658 | -18.463 |
| 1427.624512 | -18.445 |
| 1427.724365 | -18.427 |
| 1427.824219 | -18.408 |
| 1427.924072 | -18.389 |
| 1428.024048 | -18.369 |
| 1428.123901 | -18.349 |
| 1428.223877 | -18.328 |
| 1428.32373 | -18.307 |
| 1428.423706 | -18.285 |
| 1428.523682 | -18.262 |
| 1428.623657 | -18.239 |
| 1428.723633 | -18.215 |
| 1428.823608 | -18.19 |
| 1428.923706 | -18.166 |
| 1429.023682 | -18.141 |
| 1429.123779 | -18.115 |
| 1429.223877 | -18.09 |
| 1429.323975 | -18.065 |
| 1429.424072 | -18.04 |
| 1429.52417 | -18.015 |
| 1429.624268 | -17.99 |
| 1429.724365 | -17.967 |
| 1429.824585 | -17.943 |
| 1429.924683 | -17.921 |
| 1430.024902 | -17.899 |
| 1430.125 | -17.879 |
| 1430.22522 | -17.859 |
| 1430.325439 | -17.841 |
| 1430.425659 | -17.824 |
| 1430.525879 | -17.808 |
| 1430.626221 | -17.793 |
| 1430.72644 | -17.779 |
| 1430.826782 | -17.767 |
| 1430.927002 | -17.755 |
| 1431.027344 | -17.745 |
| 1431.127686 | -17.736 |
| 1431.228149 | -17.728 |
| 1431.328491 | -17.72 |
| 1431.428833 | -17.714 |
| 1431.529175 | -17.708 |
| 1431.629639 | -17.702 |
| 1431.72998 | -17.697 |
| 1431.830444 | -17.692 |
| 1431.930908 | -17.687 |
| 1432.031372 | -17.683 |
| 1432.131836 | -17.678 |
| 1432.2323 | -17.673 |
| 1432.332764 | -17.667 |
| 1432.43335 | -17.661 |
| 1432.533813 | -17.654 |
| 1432.634399 | -17.647 |
| 1432.734863 | -17.639 |
| 1432.835449 | -17.63 |
| 1432.936035 | -17.62 |
| 1433.036621 | -17.61 |
| 1433.137207 | -17.598 |
| 1433.237915 | -17.585 |
| 1433.338623 | -17.571 |
| 1433.439209 | -17.556 |
| 1433.539917 | -17.54 |
| 1433.640625 | -17.523 |
| 1433.741333 | -17.505 |
| 1433.842041 | -17.486 |
| 1433.942749 | -17.466 |
| 1434.043457 | -17.445 |
| 1434.144165 | -17.423 |
| 1434.245117 | -17.401 |
| 1434.345825 | -17.378 |
| 1434.446655 | -17.355 |
| 1434.547485 | -17.331 |
| 1434.648315 | -17.307 |
| 1434.749146 | -17.284 |
| 1434.849976 | -17.26 |
| 1434.950806 | -17.236 |
| 1435.051636 | -17.213 |
| 1435.152588 | -17.19 |
| 1435.25354 | -17.168 |
| 1435.354492 | -17.146 |
| 1435.455444 | -17.125 |
| 1435.556396 | -17.105 |
| 1435.657349 | -17.086 |
| 1435.758301 | -17.067 |
| 1435.859253 | -17.05 |
| 1435.960327 | -17.033 |
| 1436.061279 | -17.018 |
| 1436.162354 | -17.003 |
| 1436.263428 | -16.989 |
| 1436.364502 | -16.976 |
| 1436.465576 | -16.965 |
| 1436.56665 | -16.953 |
| 1436.667725 | -16.943 |
| 1436.768921 | -16.934 |
| 1436.869995 | -16.925 |
| 1436.971191 | -16.917 |
| 1437.072266 | -16.91 |
| 1437.173462 | -16.903 |
| 1437.274658 | -16.897 |
| 1437.375977 | -16.892 |
| 1437.477173 | -16.886 |
| 1437.578369 | -16.882 |
| 1437.679688 | -16.877 |
| 1437.780884 | -16.873 |
| 1437.882202 | -16.869 |
| 1437.983521 | -16.865 |
| 1438.084839 | -16.861 |
| 1438.186157 | -16.858 |
| 1438.287476 | -16.854 |
| 1438.388794 | -16.85 |
| 1438.490112 | -16.846 |
| 1438.591553 | -16.842 |
| 1438.692871 | -16.838 |
| 1438.794312 | -16.833 |
| 1438.895752 | -16.828 |
| 1438.997192 | -16.823 |
| 1439.098633 | -16.817 |
| 1439.200073 | -16.811 |
| 1439.301514 | -16.805 |
| 1439.403076 | -16.798 |
| 1439.504639 | -16.791 |
| 1439.606201 | -16.783 |
| 1439.707642 | -16.775 |
| 1439.809204 | -16.766 |
| 1439.910767 | -16.757 |
| 1440.012329 | -16.748 |
| 1440.114014 | -16.738 |
| 1440.215576 | -16.729 |
| 1440.317139 | -16.718 |
| 1440.418823 | -16.708 |
| 1440.520508 | -16.697 |
| 1440.622192 | -16.687 |
| 1440.723755 | -16.676 |
| 1440.825439 | -16.665 |
| 1440.927246 | -16.654 |
| 1441.028931 | -16.644 |
| 1441.130615 | -16.633 |
| 1441.232422 | -16.623 |
| 1441.334106 | -16.612 |
| 1441.435913 | -16.602 |
| 1441.537842 | -16.592 |
| 1441.639648 | -16.583 |
| 1441.741455 | -16.573 |
| 1441.843262 | -16.564 |
| 1441.94519 | -16.555 |
| 1442.046997 | -16.546 |
| 1442.148926 | -16.537 |
| 1442.250732 | -16.529 |
| 1442.352661 | -16.52 |
| 1442.45459 | -16.512 |
| 1442.556519 | -16.503 |
| 1442.658447 | -16.495 |
| 1442.760498 | -16.486 |
| 1442.862427 | -16.477 |
| 1442.964355 | -16.468 |
| 1443.066406 | -16.459 |
| 1443.168457 | -16.449 |
| 1443.270508 | -16.439 |
| 1443.372559 | -16.429 |
| 1443.474609 | -16.418 |
| 1443.57666 | -16.407 |
| 1443.678833 | -16.395 |
| 1443.781006 | -16.383 |
| 1443.883057 | -16.37 |
| 1443.985229 | -16.356 |
| 1444.087402 | -16.342 |
| 1444.189575 | -16.327 |
| 1444.291748 | -16.312 |
| 1444.393921 | -16.296 |
| 1444.496094 | -16.279 |
| 1444.598389 | -16.262 |
| 1444.700562 | -16.245 |
| 1444.802856 | -16.227 |
| 1444.905151 | -16.208 |
| 1445.007446 | -16.189 |
| 1445.109741 | -16.171 |
| 1445.212036 | -16.151 |
| 1445.314331 | -16.132 |
| 1445.416626 | -16.113 |
| 1445.519043 | -16.094 |
| 1445.621338 | -16.074 |
| 1445.723877 | -16.056 |
| 1445.826294 | -16.037 |
| 1445.928711 | -16.018 |
| 1446.031128 | -16 |
| 1446.133545 | -15.983 |
| 1446.235962 | -15.965 |
| 1446.338501 | -15.949 |
| 1446.440918 | -15.932 |
| 1446.543457 | -15.916 |
| 1446.645996 | -15.901 |
| 1446.748535 | -15.886 |
| 1446.851074 | -15.872 |
| 1446.953613 | -15.858 |
| 1447.056152 | -15.844 |
| 1447.158691 | -15.831 |
| 1447.261353 | -15.818 |
| 1447.364014 | -15.806 |
| 1447.466675 | -15.793 |
| 1447.569336 | -15.781 |
| 1447.671997 | -15.77 |
| 1447.774658 | -15.758 |
| 1447.877441 | -15.747 |
| 1447.980103 | -15.736 |
| 1448.082886 | -15.724 |
| 1448.185669 | -15.713 |
| 1448.28833 | -15.702 |
| 1448.391113 | -15.691 |
| 1448.493896 | -15.68 |
| 1448.59668 | -15.669 |
| 1448.699463 | -15.658 |
| 1448.802246 | -15.647 |
| 1448.905151 | -15.637 |
| 1449.007935 | -15.626 |
| 1449.11084 | -15.615 |
| 1449.213745 | -15.605 |
| 1449.31665 | -15.594 |
| 1449.419556 | -15.584 |
| 1449.522461 | -15.573 |
| 1449.625366 | -15.563 |
| 1449.728394 | -15.553 |
| 1449.831299 | -15.543 |
| 1449.934326 | -15.534 |
| 1450.037354 | -15.524 |
| 1450.140381 | -15.515 |
| 1450.243408 | -15.505 |
| 1450.346436 | -15.496 |
| 1450.449463 | -15.487 |
| 1450.552612 | -15.478 |
| 1450.65564 | -15.469 |
| 1450.758789 | -15.461 |
| 1450.861816 | -15.452 |
| 1450.964966 | -15.443 |
| 1451.068115 | -15.434 |
| 1451.171265 | -15.425 |
| 1451.274414 | -15.416 |
| 1451.377686 | -15.407 |
| 1451.480835 | -15.397 |
| 1451.584106 | -15.388 |
| 1451.687256 | -15.378 |
| 1451.790527 | -15.368 |
| 1451.893799 | -15.358 |
| 1451.99707 | -15.348 |
| 1452.100464 | -15.337 |
| 1452.203735 | -15.327 |
| 1452.307007 | -15.316 |
| 1452.4104 | -15.305 |
| 1452.513794 | -15.294 |
| 1452.617065 | -15.283 |
| 1452.720459 | -15.272 |
| 1452.823853 | -15.26 |
| 1452.927246 | -15.249 |
| 1453.03064 | -15.238 |
| 1453.134155 | -15.226 |
| 1453.237549 | -15.215 |
| 1453.341064 | -15.203 |
| 1453.44458 | -15.192 |
| 1453.547974 | -15.181 |
| 1453.651489 | -15.169 |
| 1453.755005 | -15.158 |
| 1453.858643 | -15.147 |
| 1453.962158 | -15.136 |
| 1454.065674 | -15.125 |
| 1454.169434 | -15.114 |
| 1454.272949 | -15.103 |
| 1454.376587 | -15.093 |
| 1454.480225 | -15.082 |
| 1454.583862 | -15.071 |
| 1454.6875 | -15.061 |
| 1454.791138 | -15.05 |
| 1454.894897 | -15.04 |
| 1454.998535 | -15.03 |
| 1455.102295 | -15.019 |
| 1455.206055 | -15.009 |
| 1455.309814 | -14.999 |
| 1455.413574 | -14.989 |
| 1455.517334 | -14.979 |
| 1455.621094 | -14.969 |
| 1455.724854 | -14.96 |
| 1455.828735 | -14.95 |
| 1455.932495 | -14.941 |
| 1456.036377 | -14.932 |
| 1456.140259 | -14.923 |
| 1456.244141 | -14.915 |
| 1456.348145 | -14.907 |
| 1456.452026 | -14.899 |
| 1456.555908 | -14.891 |
| 1456.659912 | -14.884 |
| 1456.763916 | -14.876 |
| 1456.867798 | -14.869 |
| 1456.971802 | -14.863 |
| 1457.075806 | -14.856 |
| 1457.17981 | -14.849 |
| 1457.283813 | -14.842 |
| 1457.387939 | -14.835 |
| 1457.491943 | -14.828 |
| 1457.596069 | -14.82 |
| 1457.700073 | -14.812 |
| 1457.804199 | -14.804 |
| 1457.908325 | -14.795 |
| 1458.012451 | -14.785 |
| 1458.116577 | -14.775 |
| 1458.220703 | -14.765 |
| 1458.324951 | -14.754 |
| 1458.429199 | -14.742 |
| 1458.533447 | -14.73 |
| 1458.637695 | -14.717 |
| 1458.741821 | -14.704 |
| 1458.846069 | -14.691 |
| 1458.950439 | -14.677 |
| 1459.054688 | -14.663 |
| 1459.158936 | -14.648 |
| 1459.263306 | -14.634 |
| 1459.367554 | -14.62 |
| 1459.471924 | -14.606 |
| 1459.576294 | -14.591 |
| 1459.680664 | -14.578 |
| 1459.785034 | -14.564 |
| 1459.889404 | -14.551 |
| 1459.993896 | -14.538 |
| 1460.098267 | -14.525 |
| 1460.202759 | -14.513 |
| 1460.307129 | -14.501 |
| 1460.411621 | -14.489 |
| 1460.516113 | -14.478 |
| 1460.620728 | -14.467 |
| 1460.72522 | -14.456 |
| 1460.829834 | -14.446 |
| 1460.934448 | -14.435 |
| 1461.039063 | -14.425 |
| 1461.143555 | -14.415 |
| 1461.248169 | -14.405 |
| 1461.352783 | -14.395 |
| 1461.457397 | -14.384 |
| 1461.562012 | -14.374 |
| 1461.666748 | -14.364 |
| 1461.771362 | -14.353 |
| 1461.876099 | -14.343 |
| 1461.980713 | -14.332 |
| 1462.085449 | -14.321 |
| 1462.190186 | -14.311 |
| 1462.294922 | -14.3 |
| 1462.399658 | -14.289 |
| 1462.504517 | -14.278 |
| 1462.609253 | -14.267 |
| 1462.714233 | -14.257 |
| 1462.81897 | -14.246 |
| 1462.923828 | -14.235 |
| 1463.028687 | -14.225 |
| 1463.133545 | -14.214 |
| 1463.238403 | -14.204 |
| 1463.343262 | -14.194 |
| 1463.448242 | -14.184 |
| 1463.553101 | -14.174 |
| 1463.658081 | -14.164 |
| 1463.763062 | -14.155 |
| 1463.868042 | -14.145 |
| 1463.973022 | -14.135 |
| 1464.078003 | -14.126 |
| 1464.182983 | -14.116 |
| 1464.288086 | -14.107 |
| 1464.393066 | -14.097 |
| 1464.498169 | -14.088 |
| 1464.603149 | -14.078 |
| 1464.708252 | -14.068 |
| 1464.813354 | -14.059 |
| 1464.918579 | -14.049 |
| 1465.023804 | -14.039 |
| 1465.128906 | -14.029 |
| 1465.234009 | -14.019 |
| 1465.339233 | -14.009 |
| 1465.444458 | -13.999 |
| 1465.549683 | -13.989 |
| 1465.654907 | -13.979 |
| 1465.760132 | -13.97 |
| 1465.865356 | -13.96 |
| 1465.970581 | -13.95 |
| 1466.075928 | -13.94 |
| 1466.181274 | -13.931 |
| 1466.286499 | -13.921 |
| 1466.391846 | -13.911 |
| 1466.497192 | -13.902 |
| 1466.602539 | -13.892 |
| 1466.708008 | -13.883 |
| 1466.813354 | -13.873 |
| 1466.918701 | -13.863 |
| 1467.024292 | -13.853 |
| 1467.129761 | -13.843 |
| 1467.235229 | -13.833 |
| 1467.340576 | -13.822 |
| 1467.446167 | -13.811 |
| 1467.551636 | -13.8 |
| 1467.657104 | -13.789 |
| 1467.762695 | -13.777 |
| 1467.868164 | -13.766 |
| 1467.973755 | -13.753 |
| 1468.079346 | -13.741 |
| 1468.184937 | -13.728 |
| 1468.290527 | -13.715 |
| 1468.396118 | -13.702 |
| 1468.501831 | -13.689 |
| 1468.607422 | -13.675 |
| 1468.713135 | -13.662 |
| 1468.818726 | -13.648 |
| 1468.924438 | -13.634 |
| 1469.030151 | -13.62 |
| 1469.135986 | -13.606 |
| 1469.241699 | -13.591 |
| 1469.347534 | -13.577 |
| 1469.453247 | -13.562 |
| 1469.559082 | -13.548 |
| 1469.664917 | -13.533 |
| 1469.77063 | -13.518 |
| 1469.876465 | -13.502 |
| 1469.9823 | -13.487 |
| 1470.088257 | -13.471 |
| 1470.194092 | -13.455 |
| 1470.300049 | -13.439 |
| 1470.405884 | -13.423 |
| 1470.511841 | -13.406 |
| 1470.617798 | -13.389 |
| 1470.723755 | -13.372 |
| 1470.829712 | -13.354 |
| 1470.935669 | -13.336 |
| 1471.041626 | -13.318 |
| 1471.147705 | -13.299 |
| 1471.253662 | -13.281 |
| 1471.359863 | -13.262 |
| 1471.465942 | -13.243 |
| 1471.572021 | -13.223 |
| 1471.678101 | -13.204 |
| 1471.78418 | -13.185 |
| 1471.890381 | -13.165 |
| 1471.99646 | -13.146 |
| 1472.102661 | -13.126 |
| 1472.20874 | -13.106 |
| 1472.314941 | -13.087 |
| 1472.421143 | -13.067 |
| 1472.527344 | -13.048 |
| 1472.633545 | -13.028 |
| 1472.739868 | -13.009 |
| 1472.846069 | -12.99 |
| 1472.952393 | -12.971 |
| 1473.058716 | -12.952 |
| 1473.165039 | -12.933 |
| 1473.271362 | -12.914 |
| 1473.377686 | -12.896 |
| 1473.484131 | -12.877 |
| 1473.590454 | -12.859 |
| 1473.696899 | -12.841 |
| 1473.803223 | -12.823 |
| 1473.909668 | -12.805 |
| 1474.016113 | -12.787 |
| 1474.122559 | -12.77 |
| 1474.229004 | -12.753 |
| 1474.335449 | -12.736 |
| 1474.442017 | -12.719 |
| 1474.548462 | -12.702 |
| 1474.655029 | -12.686 |
| 1474.761597 | -12.67 |
| 1474.868164 | -12.654 |
| 1474.974731 | -12.638 |
| 1475.081299 | -12.623 |
| 1475.187866 | -12.607 |
| 1475.294556 | -12.592 |
| 1475.401123 | -12.577 |
| 1475.507813 | -12.562 |
| 1475.614502 | -12.547 |
| 1475.721313 | -12.533 |
| 1475.828003 | -12.518 |
| 1475.934692 | -12.503 |
| 1476.041382 | -12.488 |
| 1476.148071 | -12.474 |
| 1476.254883 | -12.459 |
| 1476.361572 | -12.444 |
| 1476.468384 | -12.43 |
| 1476.575195 | -12.415 |
| 1476.682007 | -12.4 |
| 1476.788818 | -12.385 |
| 1476.895752 | -12.37 |
| 1477.002563 | -12.355 |
| 1477.109375 | -12.34 |
| 1477.216309 | -12.325 |
| 1477.323242 | -12.31 |
| 1477.430176 | -12.295 |
| 1477.537109 | -12.279 |
| 1477.644043 | -12.264 |
| 1477.750977 | -12.248 |
| 1477.858154 | -12.232 |
| 1477.965088 | -12.217 |
| 1478.072144 | -12.201 |
| 1478.179199 | -12.184 |
| 1478.286255 | -12.168 |
| 1478.393311 | -12.152 |
| 1478.500366 | -12.135 |
| 1478.607422 | -12.118 |
| 1478.7146 | -12.101 |
| 1478.821655 | -12.083 |
| 1478.928833 | -12.066 |
| 1479.036011 | -12.048 |
| 1479.143188 | -12.03 |
| 1479.250366 | -12.012 |
| 1479.357544 | -11.994 |
| 1479.464722 | -11.976 |
| 1479.572021 | -11.958 |
| 1479.679199 | -11.939 |
| 1479.786499 | -11.921 |
| 1479.893799 | -11.902 |
| 1480.001099 | -11.883 |
| 1480.108521 | -11.865 |
| 1480.21582 | -11.846 |
| 1480.32312 | -11.828 |
| 1480.430542 | -11.809 |
| 1480.537842 | -11.79 |
| 1480.645264 | -11.772 |
| 1480.752686 | -11.753 |
| 1480.860107 | -11.734 |
| 1480.967529 | -11.716 |
| 1481.074951 | -11.697 |
| 1481.182373 | -11.679 |
| 1481.289917 | -11.66 |
| 1481.397461 | -11.641 |
| 1481.504883 | -11.622 |
| 1481.612427 | -11.604 |
| 1481.719971 | -11.585 |
| 1481.827515 | -11.566 |
| 1481.935181 | -11.547 |
| 1482.042725 | -11.528 |
| 1482.150269 | -11.508 |
| 1482.258057 | -11.489 |
| 1482.365723 | -11.47 |
| 1482.473389 | -11.451 |
| 1482.581055 | -11.431 |
| 1482.688721 | -11.412 |
| 1482.796387 | -11.393 |
| 1482.904175 | -11.373 |
| 1483.011841 | -11.354 |
| 1483.119629 | -11.335 |
| 1483.227417 | -11.315 |
| 1483.335083 | -11.296 |
| 1483.442993 | -11.277 |
| 1483.550781 | -11.258 |
| 1483.658569 | -11.239 |
| 1483.766357 | -11.22 |
| 1483.874268 | -11.201 |
| 1483.982178 | -11.183 |
| 1484.090088 | -11.164 |
| 1484.197876 | -11.146 |
| 1484.305908 | -11.128 |
| 1484.413818 | -11.11 |
| 1484.521851 | -11.092 |
| 1484.629761 | -11.075 |
| 1484.737793 | -11.057 |
| 1484.845825 | -11.04 |
| 1484.953857 | -11.023 |
| 1485.06189 | -11.006 |
| 1485.169922 | -10.989 |
| 1485.277954 | -10.973 |
| 1485.385986 | -10.956 |
| 1485.494141 | -10.94 |
| 1485.602173 | -10.923 |
| 1485.710327 | -10.907 |
| 1485.818481 | -10.89 |
| 1485.926636 | -10.874 |
| 1486.03479 | -10.857 |
| 1486.142944 | -10.84 |
| 1486.251221 | -10.824 |
| 1486.359375 | -10.807 |
| 1486.467651 | -10.79 |
| 1486.575928 | -10.772 |
| 1486.684326 | -10.755 |
| 1486.792603 | -10.737 |
| 1486.900879 | -10.719 |
| 1487.009155 | -10.701 |
| 1487.117554 | -10.683 |
| 1487.22583 | -10.664 |
| 1487.334229 | -10.645 |
| 1487.442627 | -10.626 |
| 1487.551025 | -10.607 |
| 1487.659424 | -10.588 |
| 1487.767822 | -10.568 |
| 1487.876221 | -10.548 |
| 1487.984741 | -10.528 |
| 1488.09314 | -10.508 |
| 1488.20166 | -10.488 |
| 1488.310181 | -10.468 |
| 1488.418701 | -10.447 |
| 1488.527222 | -10.427 |
| 1488.635864 | -10.406 |
| 1488.744507 | -10.385 |
| 1488.853149 | -10.365 |
| 1488.961792 | -10.344 |
| 1489.070313 | -10.323 |
| 1489.178955 | -10.302 |
| 1489.287598 | -10.281 |
| 1489.39624 | -10.26 |
| 1489.505005 | -10.239 |
| 1489.613647 | -10.218 |
| 1489.722412 | -10.197 |
| 1489.831055 | -10.176 |
| 1489.939819 | -10.155 |
| 1490.048584 | -10.134 |
| 1490.157349 | -10.113 |
| 1490.266113 | -10.092 |
| 1490.375 | -10.071 |
| 1490.483765 | -10.05 |
| 1490.592651 | -10.029 |
| 1490.701416 | -10.009 |
| 1490.810303 | -9.988 |
| 1490.919189 | -9.967 |
| 1491.028076 | -9.946 |
| 1491.137085 | -9.926 |
| 1491.246094 | -9.905 |
| 1491.35498 | -9.885 |
| 1491.463989 | -9.865 |
| 1491.572998 | -9.844 |
| 1491.682007 | -9.824 |
| 1491.791016 | -9.804 |
| 1491.900024 | -9.784 |
| 1492.009033 | -9.764 |
| 1492.118042 | -9.745 |
| 1492.227173 | -9.725 |
| 1492.336304 | -9.705 |
| 1492.445313 | -9.686 |
| 1492.554443 | -9.666 |
| 1492.663574 | -9.647 |
| 1492.772827 | -9.627 |
| 1492.881958 | -9.608 |
| 1492.991089 | -9.589 |
| 1493.100342 | -9.569 |
| 1493.209595 | -9.55 |
| 1493.318848 | -9.53 |
| 1493.428101 | -9.511 |
| 1493.537476 | -9.491 |
| 1493.646729 | -9.472 |
| 1493.755981 | -9.452 |
| 1493.865356 | -9.432 |
| 1493.974609 | -9.413 |
| 1494.083984 | -9.393 |
| 1494.193359 | -9.373 |
| 1494.302734 | -9.353 |
| 1494.412109 | -9.334 |
| 1494.521484 | -9.314 |
| 1494.630981 | -9.294 |
| 1494.740356 | -9.275 |
| 1494.849854 | -9.255 |
| 1494.959351 | -9.235 |
| 1495.068848 | -9.216 |
| 1495.178345 | -9.196 |
| 1495.287842 | -9.177 |
| 1495.397339 | -9.157 |
| 1495.506958 | -9.138 |
| 1495.616577 | -9.118 |
| 1495.726196 | -9.099 |
| 1495.835815 | -9.08 |
| 1495.945435 | -9.06 |
| 1496.055054 | -9.041 |
| 1496.164673 | -9.022 |
| 1496.274414 | -9.003 |
| 1496.384033 | -8.983 |
| 1496.493774 | -8.964 |
| 1496.603516 | -8.945 |
| 1496.713257 | -8.925 |
| 1496.822998 | -8.906 |
| 1496.932739 | -8.886 |
| 1497.04248 | -8.866 |
| 1497.152344 | -8.847 |
| 1497.262085 | -8.827 |
| 1497.371948 | -8.807 |
| 1497.481812 | -8.787 |
| 1497.591675 | -8.766 |
| 1497.701538 | -8.746 |
| 1497.811523 | -8.726 |
| 1497.921387 | -8.705 |
| 1498.031372 | -8.685 |
| 1498.141357 | -8.664 |
| 1498.251221 | -8.643 |
| 1498.361206 | -8.623 |
| 1498.471191 | -8.602 |
| 1498.581177 | -8.581 |
| 1498.691284 | -8.56 |
| 1498.80127 | -8.539 |
| 1498.911377 | -8.517 |
| 1499.021362 | -8.496 |
| 1499.13147 | -8.475 |
| 1499.241577 | -8.454 |
| 1499.351685 | -8.433 |
| 1499.461914 | -8.411 |
| 1499.572021 | -8.39 |
| 1499.682129 | -8.369 |
| 1499.792358 | -8.347 |
| 1499.902588 | -8.326 |
| 1500.012817 | -8.304 |
| 1500.123169 | -8.283 |
| 1500.233398 | -8.261 |
| 1500.343628 | -8.24 |
| 1500.453857 | -8.218 |
| 1500.564209 | -8.197 |
| 1500.674561 | -8.175 |
| 1500.784912 | -8.153 |
| 1500.895142 | -8.132 |
| 1501.005615 | -8.11 |
| 1501.115967 | -8.089 |
| 1501.226318 | -8.067 |
| 1501.336792 | -8.046 |
| 1501.447144 | -8.024 |
| 1501.557617 | -8.003 |
| 1501.668091 | -7.982 |
| 1501.778564 | -7.96 |
| 1501.889038 | -7.939 |
| 1501.999512 | -7.918 |
| 1502.110107 | -7.897 |
| 1502.220581 | -7.876 |
| 1502.331299 | -7.855 |
| 1502.441895 | -7.834 |
| 1502.55249 | -7.813 |
| 1502.663086 | -7.793 |
| 1502.773682 | -7.772 |
| 1502.884399 | -7.752 |
| 1502.995117 | -7.731 |
| 1503.105713 | -7.711 |
| 1503.216431 | -7.69 |
| 1503.327148 | -7.67 |
| 1503.437866 | -7.65 |
| 1503.548584 | -7.63 |
| 1503.659302 | -7.61 |
| 1503.770142 | -7.59 |
| 1503.880859 | -7.57 |
| 1503.991699 | -7.55 |
| 1504.102539 | -7.53 |
| 1504.213379 | -7.51 |
| 1504.324219 | -7.49 |
| 1504.435059 | -7.47 |
| 1504.546021 | -7.45 |
| 1504.656982 | -7.43 |
| 1504.767822 | -7.41 |
| 1504.878784 | -7.39 |
| 1504.989746 | -7.37 |
| 1505.100708 | -7.349 |
| 1505.21167 | -7.329 |
| 1505.322754 | -7.309 |
| 1505.433716 | -7.288 |
| 1505.5448 | -7.268 |
| 1505.655762 | -7.247 |
| 1505.766846 | -7.226 |
| 1505.87793 | -7.205 |
| 1505.989014 | -7.185 |
| 1506.100098 | -7.164 |
| 1506.211304 | -7.143 |
| 1506.322388 | -7.122 |
| 1506.433594 | -7.101 |
| 1506.5448 | -7.08 |
| 1506.656006 | -7.059 |
| 1506.767212 | -7.037 |
| 1506.87854 | -7.016 |
| 1506.989746 | -6.995 |
| 1507.100952 | -6.974 |
| 1507.21228 | -6.953 |
| 1507.323608 | -6.932 |
| 1507.434937 | -6.91 |
| 1507.546143 | -6.889 |
| 1507.657593 | -6.868 |
| 1507.768921 | -6.847 |
| 1507.880249 | -6.826 |
| 1507.991699 | -6.804 |
| 1508.103027 | -6.783 |
| 1508.214478 | -6.762 |
| 1508.325928 | -6.741 |
| 1508.437378 | -6.72 |
| 1508.548828 | -6.699 |
| 1508.6604 | -6.677 |
| 1508.771851 | -6.656 |
| 1508.883423 | -6.635 |
| 1508.994995 | -6.614 |
| 1509.106567 | -6.593 |
| 1509.21814 | -6.571 |
| 1509.329712 | -6.55 |
| 1509.441406 | -6.529 |
| 1509.552979 | -6.507 |
| 1509.664673 | -6.486 |
| 1509.776245 | -6.465 |
| 1509.887939 | -6.443 |
| 1509.999634 | -6.422 |
| 1510.111328 | -6.401 |
| 1510.223022 | -6.379 |
| 1510.334839 | -6.358 |
| 1510.446533 | -6.337 |
| 1510.55835 | -6.315 |
| 1510.670166 | -6.294 |
| 1510.781982 | -6.273 |
| 1510.893799 | -6.251 |
| 1511.005615 | -6.23 |
| 1511.117432 | -6.209 |
| 1511.22937 | -6.187 |
| 1511.341187 | -6.166 |
| 1511.453247 | -6.145 |
| 1511.565186 | -6.123 |
| 1511.677124 | -6.102 |
| 1511.789063 | -6.081 |
| 1511.901001 | -6.06 |
| 1512.012939 | -6.039 |
| 1512.125 | -6.017 |
| 1512.237061 | -5.996 |
| 1512.348999 | -5.975 |
| 1512.46106 | -5.954 |
| 1512.57312 | -5.933 |
| 1512.685303 | -5.912 |
| 1512.797363 | -5.891 |
| 1512.909424 | -5.869 |
| 1513.021606 | -5.848 |
| 1513.133789 | -5.827 |
| 1513.245972 | -5.806 |
| 1513.358154 | -5.785 |
| 1513.470337 | -5.763 |
| 1513.58252 | -5.742 |
| 1513.694824 | -5.721 |
| 1513.807129 | -5.699 |
| 1513.919434 | -5.678 |
| 1514.031738 | -5.656 |
| 1514.144043 | -5.635 |
| 1514.256348 | -5.613 |
| 1514.368652 | -5.591 |
| 1514.480957 | -5.569 |
| 1514.593384 | -5.548 |
| 1514.705688 | -5.526 |
| 1514.818115 | -5.504 |
| 1514.930542 | -5.482 |
| 1515.042969 | -5.459 |
| 1515.155396 | -5.437 |
| 1515.267944 | -5.415 |
| 1515.380371 | -5.392 |
| 1515.49292 | -5.37 |
| 1515.605469 | -5.347 |
| 1515.718018 | -5.325 |
| 1515.830566 | -5.302 |
| 1515.943237 | -5.28 |
| 1516.055786 | -5.257 |
| 1516.168335 | -5.235 |
| 1516.281006 | -5.212 |
| 1516.393677 | -5.189 |
| 1516.506348 | -5.167 |
| 1516.619019 | -5.144 |
| 1516.731689 | -5.121 |
| 1516.84436 | -5.099 |
| 1516.957031 | -5.076 |
| 1517.069824 | -5.054 |
| 1517.182617 | -5.031 |
| 1517.295288 | -5.009 |
| 1517.408203 | -4.986 |
| 1517.520996 | -4.964 |
| 1517.633911 | -4.941 |
| 1517.746704 | -4.919 |
| 1517.859497 | -4.896 |
| 1517.972412 | -4.874 |
| 1518.085327 | -4.852 |
| 1518.198242 | -4.83 |
| 1518.311279 | -4.807 |
| 1518.424194 | -4.785 |
| 1518.537109 | -4.763 |
| 1518.650146 | -4.741 |
| 1518.763062 | -4.719 |
| 1518.876099 | -4.697 |
| 1518.989136 | -4.676 |
| 1519.102173 | -4.654 |
| 1519.21521 | -4.632 |
| 1519.328247 | -4.611 |
| 1519.441406 | -4.59 |
| 1519.554443 | -4.568 |
| 1519.667603 | -4.547 |
| 1519.780762 | -4.526 |
| 1519.893921 | -4.505 |
| 1520.00708 | -4.484 |
| 1520.120239 | -4.464 |
| 1520.233521 | -4.443 |
| 1520.34668 | -4.423 |
| 1520.459961 | -4.403 |
| 1520.573364 | -4.383 |
| 1520.686646 | -4.363 |
| 1520.799927 | -4.343 |
| 1520.913208 | -4.323 |
| 1521.026489 | -4.304 |
| 1521.139893 | -4.285 |
| 1521.253174 | -4.266 |
| 1521.366577 | -4.247 |
| 1521.47998 | -4.228 |
| 1521.593384 | -4.21 |
| 1521.706787 | -4.191 |
| 1521.820313 | -4.173 |
| 1521.933716 | -4.155 |
| 1522.047241 | -4.137 |
| 1522.160645 | -4.12 |
| 1522.27417 | -4.102 |
| 1522.387695 | -4.085 |
| 1522.501343 | -4.069 |
| 1522.614868 | -4.052 |
| 1522.728394 | -4.036 |
| 1522.842041 | -4.019 |
| 1522.955811 | -4.004 |
| 1523.069336 | -3.988 |
| 1523.182983 | -3.973 |
| 1523.296753 | -3.958 |
| 1523.4104 | -3.943 |
| 1523.524048 | -3.929 |
| 1523.637817 | -3.915 |
| 1523.751465 | -3.901 |
| 1523.865234 | -3.887 |
| 1523.979004 | -3.874 |
| 1524.092773 | -3.861 |
| 1524.206665 | -3.849 |
| 1524.320435 | -3.837 |
| 1524.434326 | -3.825 |
| 1524.548096 | -3.814 |
| 1524.661987 | -3.803 |
| 1524.775879 | -3.792 |
| 1524.889771 | -3.781 |
| 1525.003662 | -3.772 |
| 1525.117676 | -3.762 |
| 1525.231689 | -3.753 |
| 1525.345703 | -3.744 |
| 1525.459595 | -3.735 |
| 1525.573608 | -3.727 |
| 1525.687622 | -3.72 |
| 1525.801758 | -3.713 |
| 1525.915771 | -3.706 |
| 1526.029785 | -3.7 |
| 1526.143921 | -3.694 |
| 1526.258057 | -3.689 |
| 1526.372192 | -3.685 |
| 1526.486328 | -3.681 |
| 1526.600464 | -3.677 |
| 1526.7146 | -3.675 |
| 1526.828857 | -3.672 |
| 1526.942993 | -3.671 |
| 1527.057251 | -3.67 |
| 1527.171509 | -3.669 |
| 1527.285767 | -3.669 |
| 1527.400024 | -3.67 |
| 1527.514404 | -3.671 |
| 1527.628784 | -3.673 |
| 1527.743042 | -3.674 |
| 1527.857422 | -3.677 |
| 1527.971802 | -3.679 |
| 1528.086182 | -3.682 |
| 1528.200562 | -3.684 |
| 1528.314941 | -3.687 |
| 1528.429443 | -3.689 |
| 1528.543823 | -3.691 |
| 1528.658325 | -3.693 |
| 1528.772827 | -3.693 |
| 1528.887329 | -3.694 |
| 1529.001831 | -3.693 |
| 1529.116333 | -3.691 |
| 1529.230957 | -3.688 |
| 1529.345459 | -3.683 |
| 1529.460083 | -3.677 |
| 1529.574707 | -3.669 |
| 1529.689331 | -3.66 |
| 1529.803955 | -3.648 |
| 1529.918701 | -3.634 |
| 1530.033325 | -3.618 |
| 1530.148071 | -3.599 |
| 1530.262817 | -3.578 |
| 1530.377441 | -3.554 |
| 1530.492188 | -3.527 |
| 1530.606934 | -3.497 |
| 1530.721802 | -3.465 |
| 1530.836548 | -3.429 |
| 1530.951416 | -3.391 |
| 1531.066162 | -3.35 |
| 1531.18103 | -3.307 |
| 1531.295898 | -3.261 |
| 1531.410767 | -3.212 |
| 1531.525635 | -3.162 |
| 1531.640625 | -3.11 |
| 1531.755493 | -3.056 |
| 1531.870483 | -3.002 |
| 1531.985474 | -2.946 |
| 1532.100464 | -2.89 |
| 1532.215576 | -2.835 |
| 1532.330688 | -2.781 |
| 1532.445679 | -2.727 |
| 1532.560669 | -2.676 |
| 1532.675781 | -2.627 |
| 1532.790894 | -2.581 |
| 1532.906006 | -2.538 |
| 1533.021118 | -2.5 |
| 1533.13623 | -2.466 |
| 1533.251343 | -2.437 |
| 1533.366577 | -2.414 |
| 1533.481812 | -2.397 |
| 1533.596924 | -2.387 |
| 1533.712158 | -2.384 |
| 1533.827393 | -2.388 |
| 1533.942627 | -2.399 |
| 1534.057983 | -2.419 |
| 1534.173218 | -2.447 |
| 1534.288574 | -2.483 |
| 1534.403931 | -2.527 |
| 1534.519287 | -2.58 |
| 1534.634766 | -2.642 |
| 1534.750122 | -2.712 |
| 1534.865479 | -2.79 |
| 1534.980957 | -2.875 |
| 1535.096313 | -2.969 |
| 1535.211792 | -3.07 |
| 1535.327271 | -3.177 |
| 1535.442749 | -3.291 |
| 1535.558228 | -3.41 |
| 1535.673706 | -3.535 |
| 1535.789307 | -3.663 |
| 1535.904785 | -3.794 |
| 1536.020386 | -3.927 |
| 1536.135986 | -4.062 |
| 1536.251587 | -4.197 |
| 1536.367188 | -4.33 |
| 1536.48291 | -4.461 |
| 1536.598511 | -4.589 |
| 1536.714233 | -4.712 |
| 1536.829834 | -4.83 |
| 1536.945679 | -4.941 |
| 1537.061401 | -5.045 |
| 1537.177246 | -5.14 |
| 1537.292969 | -5.226 |
| 1537.408691 | -5.303 |
| 1537.524536 | -5.371 |
| 1537.640381 | -5.428 |
| 1537.756226 | -5.475 |
| 1537.87207 | -5.513 |
| 1537.987915 | -5.542 |
| 1538.10376 | -5.561 |
| 1538.219727 | -5.572 |
| 1538.335571 | -5.575 |
| 1538.451538 | -5.571 |
| 1538.567505 | -5.561 |
| 1538.683472 | -5.546 |
| 1538.799438 | -5.525 |
| 1538.915405 | -5.501 |
| 1539.031494 | -5.473 |
| 1539.147461 | -5.442 |
| 1539.263672 | -5.41 |
| 1539.379761 | -5.376 |
| 1539.49585 | -5.341 |
| 1539.611938 | -5.306 |
| 1539.728149 | -5.272 |
| 1539.844238 | -5.238 |
| 1539.960449 | -5.205 |
| 1540.07666 | -5.174 |
| 1540.192749 | -5.144 |
| 1540.30896 | -5.117 |
| 1540.425293 | -5.092 |
| 1540.541504 | -5.07 |
| 1540.657715 | -5.051 |
| 1540.774048 | -5.036 |
| 1540.890381 | -5.024 |
| 1541.006714 | -5.015 |
| 1541.123047 | -5.011 |
| 1541.23938 | -5.01 |
| 1541.355713 | -5.014 |
| 1541.472168 | -5.022 |
| 1541.588501 | -5.034 |
| 1541.705078 | -5.052 |
| 1541.821533 | -5.073 |
| 1541.937988 | -5.1 |
| 1542.054443 | -5.131 |
| 1542.171021 | -5.168 |
| 1542.287476 | -5.209 |
| 1542.404053 | -5.255 |
| 1542.52063 | -5.306 |
| 1542.637207 | -5.361 |
| 1542.753784 | -5.421 |
| 1542.870361 | -5.486 |
| 1542.986938 | -5.556 |
| 1543.103638 | -5.629 |
| 1543.220215 | -5.707 |
| 1543.336914 | -5.789 |
| 1543.453613 | -5.874 |
| 1543.570313 | -5.963 |
| 1543.687012 | -6.055 |
| 1543.803833 | -6.15 |
| 1543.920532 | -6.247 |
| 1544.037476 | -6.346 |
| 1544.154297 | -6.447 |
| 1544.271118 | -6.549 |
| 1544.387939 | -6.651 |
| 1544.504761 | -6.755 |
| 1544.621582 | -6.858 |
| 1544.738525 | -6.96 |
| 1544.855469 | -7.062 |
| 1544.97229 | -7.161 |
| 1545.089233 | -7.259 |
| 1545.206299 | -7.355 |
| 1545.323242 | -7.448 |
| 1545.440186 | -7.537 |
| 1545.557251 | -7.623 |
| 1545.674194 | -7.705 |
| 1545.79126 | -7.782 |
| 1545.908325 | -7.855 |
| 1546.025391 | -7.922 |
| 1546.142578 | -7.985 |
| 1546.259644 | -8.043 |
| 1546.376831 | -8.094 |
| 1546.494019 | -8.141 |
| 1546.611206 | -8.182 |
| 1546.728394 | -8.217 |
| 1546.845581 | -8.247 |
| 1546.962891 | -8.272 |
| 1547.080078 | -8.292 |
| 1547.19751 | -8.306 |
| 1547.314697 | -8.316 |
| 1547.432007 | -8.321 |
| 1547.549316 | -8.322 |
| 1547.666626 | -8.32 |
| 1547.784058 | -8.314 |
| 1547.901367 | -8.304 |
| 1548.018799 | -8.292 |
| 1548.136108 | -8.277 |
| 1548.25354 | -8.261 |
| 1548.370972 | -8.242 |
| 1548.488525 | -8.223 |
| 1548.605957 | -8.202 |
| 1548.723389 | -8.181 |
| 1548.841064 | -8.16 |
| 1548.958618 | -8.139 |
| 1549.076172 | -8.119 |
| 1549.193726 | -8.099 |
| 1549.311279 | -8.08 |
| 1549.428833 | -8.062 |
| 1549.546509 | -8.045 |
| 1549.664063 | -8.03 |
| 1549.781738 | -8.016 |
| 1549.899414 | -8.005 |
| 1550.01709 | -7.994 |
| 1550.134888 | -7.986 |
| 1550.252563 | -7.979 |
| 1550.370239 | -7.973 |
| 1550.488037 | -7.969 |
| 1550.605835 | -7.966 |
| 1550.723633 | -7.965 |
| 1550.841431 | -7.964 |
| 1550.959229 | -7.963 |
| 1551.077148 | -7.963 |
| 1551.195068 | -7.962 |
| 1551.312988 | -7.961 |
| 1551.430908 | -7.958 |
| 1551.548828 | -7.955 |
| 1551.666748 | -7.949 |
| 1551.784668 | -7.942 |
| 1551.90271 | -7.932 |
| 1552.02063 | -7.919 |
| 1552.138672 | -7.902 |
| 1552.256714 | -7.882 |
| 1552.374756 | -7.859 |
| 1552.492798 | -7.831 |
| 1552.61084 | -7.799 |
| 1552.729004 | -7.763 |
| 1552.847046 | -7.723 |
| 1552.96521 | -7.68 |
| 1553.083374 | -7.632 |
| 1553.201538 | -7.582 |
| 1553.319702 | -7.528 |
| 1553.437988 | -7.471 |
| 1553.556152 | -7.413 |
| 1553.674561 | -7.353 |
| 1553.792725 | -7.291 |
| 1553.911011 | -7.229 |
| 1554.029419 | -7.167 |
| 1554.147705 | -7.106 |
| 1554.265991 | -7.045 |
| 1554.384399 | -6.986 |
| 1554.502686 | -6.929 |
| 1554.621094 | -6.873 |
| 1554.739502 | -6.821 |
| 1554.85791 | -6.771 |
| 1554.97644 | -6.724 |
| 1555.094849 | -6.68 |
| 1555.213257 | -6.639 |
| 1555.331787 | -6.601 |
| 1555.450317 | -6.567 |
| 1555.568848 | -6.535 |
| 1555.687378 | -6.507 |
| 1555.80603 | -6.481 |
| 1555.924561 | -6.457 |
| 1556.043335 | -6.435 |
| 1556.161865 | -6.415 |
| 1556.280518 | -6.397 |
| 1556.39917 | -6.379 |
| 1556.517822 | -6.362 |
| 1556.636597 | -6.346 |
| 1556.755249 | -6.329 |
| 1556.874023 | -6.311 |
| 1556.992798 | -6.293 |
| 1557.111572 | -6.273 |
| 1557.230347 | -6.252 |
| 1557.349121 | -6.23 |
| 1557.467896 | -6.206 |
| 1557.586792 | -6.18 |
| 1557.705566 | -6.152 |
| 1557.824463 | -6.122 |
| 1557.943359 | -6.091 |
| 1558.062256 | -6.058 |
| 1558.181274 | -6.023 |
| 1558.300171 | -5.988 |
| 1558.419312 | -5.951 |
| 1558.538208 | -5.914 |
| 1558.657227 | -5.876 |
| 1558.776245 | -5.838 |
| 1558.895264 | -5.8 |
| 1559.014404 | -5.762 |
| 1559.133423 | -5.725 |
| 1559.252563 | -5.689 |
| 1559.371582 | -5.653 |
| 1559.490723 | -5.618 |
| 1559.609863 | -5.584 |
| 1559.729126 | -5.552 |
| 1559.848267 | -5.521 |
| 1559.967529 | -5.491 |
| 1560.08667 | -5.462 |
| 1560.205933 | -5.434 |
| 1560.325195 | -5.408 |
| 1560.444458 | -5.382 |
| 1560.563721 | -5.357 |
| 1560.683105 | -5.332 |
| 1560.802368 | -5.308 |
| 1560.921875 | -5.283 |
| 1561.04126 | -5.259 |
| 1561.160645 | -5.234 |
| 1561.280029 | -5.208 |
| 1561.399414 | -5.181 |
| 1561.518921 | -5.152 |
| 1561.638306 | -5.122 |
| 1561.757813 | -5.09 |
| 1561.877319 | -5.056 |
| 1561.996826 | -5.019 |
| 1562.116333 | -4.979 |
| 1562.23584 | -4.937 |
| 1562.355469 | -4.891 |
| 1562.475098 | -4.842 |
| 1562.594727 | -4.79 |
| 1562.714355 | -4.735 |
| 1562.833984 | -4.676 |
| 1562.953735 | -4.613 |
| 1563.073364 | -4.547 |
| 1563.193115 | -4.478 |
| 1563.312866 | -4.406 |
| 1563.432617 | -4.331 |
| 1563.552368 | -4.252 |
| 1563.672119 | -4.172 |
| 1563.791992 | -4.088 |
| 1563.911743 | -4.002 |
| 1564.031616 | -3.915 |
| 1564.151367 | -3.825 |
| 1564.27124 | -3.734 |
| 1564.391113 | -3.641 |
| 1564.511108 | -3.548 |
| 1564.630981 | -3.453 |
| 1564.750854 | -3.358 |
| 1564.87085 | -3.262 |
| 1564.990845 | -3.166 |
| 1565.11084 | -3.071 |
| 1565.230835 | -2.975 |
| 1565.35083 | -2.88 |
| 1565.470947 | -2.785 |
| 1565.590942 | -2.691 |
| 1565.711182 | -2.598 |
| 1565.831299 | -2.506 |
| 1565.951416 | -2.415 |
| 1566.071533 | -2.325 |
| 1566.19165 | -2.237 |
| 1566.31189 | -2.15 |
| 1566.432007 | -2.065 |
| 1566.552246 | -1.981 |
| 1566.672485 | -1.9 |
| 1566.792725 | -1.82 |
| 1566.912964 | -1.742 |
| 1567.033325 | -1.665 |
| 1567.153564 | -1.591 |
| 1567.273926 | -1.519 |
| 1567.394287 | -1.449 |
| 1567.514648 | -1.381 |
| 1567.63501 | -1.315 |
| 1567.755371 | -1.251 |
| 1567.875732 | -1.189 |
| 1567.996216 | -1.129 |
| 1568.116699 | -1.072 |
| 1568.237305 | -1.017 |
| 1568.357788 | -0.963 |
| 1568.478271 | -0.912 |
| 1568.598755 | -0.863 |
| 1568.71936 | -0.816 |
| 1568.839844 | -0.771 |
| 1568.960449 | -0.728 |
| 1569.081055 | -0.687 |
| 1569.20166 | -0.649 |
| 1569.322266 | -0.612 |
| 1569.442993 | -0.577 |
| 1569.563599 | -0.544 |
| 1569.684326 | -0.513 |
| 1569.805054 | -0.484 |
| 1569.925781 | -0.456 |
| 1570.046509 | -0.431 |
| 1570.167236 | -0.407 |
| 1570.288086 | -0.385 |
| 1570.408813 | -0.365 |
| 1570.529663 | -0.346 |
| 1570.650635 | -0.33 |
| 1570.771484 | -0.314 |
| 1570.892334 | -0.301 |
| 1571.013306 | -0.289 |
| 1571.134155 | -0.278 |
| 1571.255127 | -0.269 |
| 1571.376099 | -0.262 |
| 1571.49707 | -0.255 |
| 1571.618042 | -0.251 |
| 1571.739014 | -0.247 |
| 1571.860107 | -0.245 |
| 1571.981079 | -0.244 |
| 1572.102173 | -0.244 |
| 1572.223267 | -0.246 |
| 1572.34436 | -0.249 |
| 1572.465454 | -0.252 |
| 1572.58667 | -0.257 |
| 1572.707764 | -0.263 |
| 1572.828979 | -0.27 |
| 1572.950195 | -0.278 |
| 1573.071533 | -0.287 |
| 1573.192749 | -0.297 |
| 1573.313965 | -0.308 |
| 1573.435181 | -0.32 |
| 1573.556519 | -0.332 |
| 1573.677856 | -0.345 |
| 1573.799194 | -0.359 |
| 1573.920532 | -0.374 |
| 1574.04187 | -0.389 |
| 1574.163208 | -0.405 |
| 1574.284668 | -0.422 |
| 1574.406006 | -0.44 |
| 1574.527466 | -0.458 |
| 1574.648926 | -0.476 |
| 1574.770386 | -0.495 |
| 1574.891968 | -0.515 |
| 1575.013428 | -0.535 |
| 1575.13501 | -0.555 |
| 1575.25647 | -0.576 |
| 1575.378052 | -0.597 |
| 1575.499634 | -0.619 |
| 1575.62146 | -0.641 |
| 1575.743042 | -0.664 |
| 1575.864624 | -0.687 |
| 1575.986328 | -0.71 |
| 1576.108032 | -0.733 |
| 1576.229736 | -0.757 |
| 1576.35144 | -0.781 |
| 1576.473145 | -0.805 |
| 1576.594971 | -0.829 |
| 1576.716675 | -0.854 |
| 1576.838501 | -0.879 |
| 1576.960327 | -0.904 |
| 1577.082153 | -0.929 |
| 1577.203979 | -0.954 |
| 1577.325806 | -0.98 |
| 1577.447754 | -1.006 |
| 1577.569702 | -1.032 |
| 1577.691528 | -1.058 |
| 1577.813477 | -1.084 |
| 1577.935547 | -1.11 |
| 1578.057617 | -1.136 |
| 1578.179565 | -1.162 |
| 1578.301758 | -1.189 |
| 1578.423828 | -1.215 |
| 1578.545898 | -1.242 |
| 1578.667969 | -1.269 |
| 1578.790039 | -1.295 |
| 1578.912109 | -1.322 |
| 1579.034302 | -1.349 |
| 1579.156372 | -1.376 |
| 1579.278564 | -1.403 |
| 1579.400757 | -1.43 |
| 1579.522949 | -1.457 |
| 1579.645264 | -1.484 |
| 1579.767456 | -1.511 |
| 1579.889771 | -1.538 |
| 1580.011963 | -1.566 |
| 1580.134277 | -1.593 |
| 1580.256592 | -1.62 |
| 1580.379028 | -1.648 |
| 1580.501465 | -1.675 |
| 1580.623901 | -1.703 |
| 1580.746216 | -1.73 |
| 1580.868652 | -1.758 |
| 1580.991089 | -1.786 |
| 1581.113525 | -1.814 |
| 1581.236084 | -1.842 |
| 1581.358521 | -1.87 |
| 1581.481079 | -1.898 |
| 1581.603516 | -1.926 |
| 1581.726074 | -1.954 |
| 1581.848633 | -1.983 |
| 1581.971313 | -2.011 |
| 1582.093872 | -2.04 |
| 1582.216553 | -2.068 |
| 1582.339111 | -2.097 |
| 1582.461792 | -2.126 |
| 1582.584473 | -2.154 |
| 1582.707153 | -2.183 |
| 1582.829956 | -2.212 |
| 1582.952637 | -2.241 |
| 1583.075562 | -2.27 |
| 1583.198364 | -2.299 |
| 1583.321167 | -2.328 |
| 1583.44397 | -2.357 |
| 1583.566772 | -2.386 |
| 1583.689575 | -2.415 |
| 1583.8125 | -2.444 |
| 1583.935425 | -2.473 |
| 1584.05835 | -2.502 |
| 1584.181274 | -2.531 |
| 1584.304199 | -2.56 |
| 1584.427124 | -2.589 |
| 1584.550171 | -2.618 |
| 1584.673218 | -2.647 |
| 1584.796143 | -2.675 |
| 1584.919189 | -2.704 |
| 1585.042236 | -2.733 |
| 1585.165405 | -2.761 |
| 1585.288452 | -2.79 |
| 1585.411621 | -2.818 |
| 1585.534912 | -2.847 |
| 1585.658081 | -2.875 |
| 1585.78125 | -2.903 |
| 1585.904419 | -2.931 |
| 1586.027588 | -2.959 |
| 1586.150879 | -2.987 |
| 1586.27417 | -3.014 |
| 1586.397339 | -3.042 |
| 1586.52063 | -3.07 |
| 1586.644043 | -3.097 |
| 1586.767334 | -3.124 |
| 1586.890747 | -3.151 |
| 1587.014038 | -3.178 |
| 1587.137451 | -3.205 |
| 1587.260864 | -3.232 |
| 1587.384277 | -3.259 |
| 1587.50769 | -3.285 |
| 1587.631226 | -3.312 |
| 1587.754639 | -3.338 |
| 1587.878174 | -3.365 |
| 1588.001831 | -3.391 |
| 1588.125366 | -3.417 |
| 1588.248901 | -3.443 |
| 1588.372559 | -3.47 |
| 1588.496094 | -3.496 |
| 1588.619751 | -3.522 |
| 1588.743408 | -3.548 |
| 1588.867065 | -3.574 |
| 1588.990723 | -3.6 |
| 1589.11438 | -3.626 |
| 1589.238159 | -3.651 |
| 1589.361938 | -3.677 |
| 1589.485596 | -3.703 |
| 1589.609375 | -3.729 |
| 1589.733154 | -3.755 |
| 1589.857056 | -3.781 |
| 1589.980835 | -3.807 |
| 1590.104736 | -3.833 |
| 1590.228638 | -3.859 |
| 1590.352417 | -3.884 |
| 1590.47644 | -3.91 |
| 1590.600464 | -3.936 |
| 1590.724365 | -3.962 |
| 1590.848389 | -3.988 |
| 1590.97229 | -4.013 |
| 1591.096313 | -4.039 |
| 1591.220337 | -4.065 |
| 1591.34436 | -4.091 |
| 1591.468506 | -4.116 |
| 1591.592529 | -4.142 |
| 1591.716675 | -4.167 |
| 1591.84082 | -4.193 |
| 1591.964966 | -4.218 |
| 1592.089111 | -4.244 |
| 1592.213257 | -4.269 |
| 1592.337524 | -4.295 |
| 1592.46167 | -4.32 |
| 1592.585938 | -4.345 |
| 1592.710205 | -4.371 |
| 1592.834473 | -4.396 |
| 1592.95874 | -4.421 |
| 1593.083252 | -4.446 |
| 1593.20752 | -4.472 |
| 1593.331909 | -4.497 |
| 1593.456299 | -4.522 |
| 1593.580688 | -4.547 |
| 1593.705078 | -4.573 |
| 1593.829468 | -4.598 |
| 1593.953979 | -4.623 |
| 1594.078491 | -4.648 |
| 1594.202881 | -4.674 |
| 1594.327515 | -4.699 |
| 1594.452148 | -4.724 |
| 1594.57666 | -4.75 |
| 1594.701172 | -4.775 |
| 1594.825806 | -4.801 |
| 1594.950439 | -4.826 |
| 1595.075073 | -4.852 |
| 1595.199707 | -4.877 |
| 1595.324341 | -4.903 |
| 1595.449097 | -4.928 |
| 1595.573853 | -4.954 |
| 1595.698608 | -4.98 |
| 1595.823364 | -5.005 |
| 1595.94812 | -5.031 |
| 1596.072876 | -5.056 |
| 1596.197632 | -5.082 |
| 1596.32251 | -5.108 |
| 1596.447388 | -5.133 |
| 1596.572266 | -5.159 |
| 1596.697144 | -5.184 |
| 1596.822021 | -5.21 |
| 1596.946899 | -5.236 |
| 1597.071899 | -5.261 |
| 1597.196777 | -5.287 |
| 1597.321777 | -5.313 |
| 1597.446777 | -5.338 |
| 1597.571777 | -5.364 |
| 1597.696899 | -5.389 |
| 1597.821899 | -5.415 |
| 1597.947021 | -5.441 |
| 1598.072144 | -5.466 |
| 1598.197266 | -5.492 |
| 1598.32251 | -5.518 |
| 1598.447632 | -5.543 |
| 1598.572754 | -5.569 |
| 1598.697998 | -5.595 |
| 1598.823242 | -5.621 |
| 1598.948486 | -5.646 |
| 1599.07373 | -5.672 |
| 1599.198975 | -5.698 |
| 1599.324219 | -5.724 |
| 1599.449585 | -5.749 |
| 1599.574951 | -5.775 |
| 1599.700195 | -5.801 |
| 1599.825562 | -5.826 |
| 1599.95105 | -5.852 |
| 1600.076416 | -5.878 |
| 1600.201904 | -5.903 |
| 1600.327271 | -5.929 |
| 1600.452759 | -5.955 |
| 1600.578247 | -5.98 |
| 1600.703857 | -6.006 |
| 1600.829468 | -6.032 |
| 1600.954956 | -6.057 |
| 1601.080566 | -6.083 |
| 1601.206177 | -6.109 |
| 1601.331787 | -6.135 |
| 1601.457397 | -6.16 |
| 1601.583008 | -6.186 |
| 1601.708618 | -6.212 |
| 1601.834351 | -6.238 |
| 1601.960083 | -6.264 |
| 1602.085815 | -6.29 |
| 1602.211548 | -6.316 |
| 1602.33728 | -6.343 |
| 1602.463135 | -6.369 |
| 1602.588867 | -6.395 |
| 1602.714722 | -6.422 |
| 1602.840576 | -6.448 |
| 1602.966431 | -6.475 |
| 1603.092285 | -6.502 |
| 1603.218384 | -6.529 |
| 1603.344238 | -6.556 |
| 1603.470215 | -6.583 |
| 1603.596191 | -6.61 |
| 1603.722168 | -6.637 |
| 1603.848145 | -6.664 |
| 1603.974121 | -6.691 |
| 1604.10022 | -6.719 |
| 1604.226318 | -6.746 |
| 1604.352295 | -6.774 |
| 1604.478394 | -6.801 |
| 1604.604614 | -6.829 |
| 1604.730713 | -6.857 |
| 1604.856934 | -6.884 |
| 1604.983032 | -6.912 |
| 1605.109253 | -6.94 |
| 1605.235474 | -6.968 |
| 1605.361694 | -6.996 |
| 1605.488037 | -7.024 |
| 1605.614258 | -7.052 |
| 1605.740601 | -7.08 |
| 1605.866943 | -7.109 |
| 1605.993286 | -7.137 |
| 1606.119751 | -7.165 |
| 1606.246094 | -7.194 |
| 1606.372437 | -7.222 |
| 1606.498901 | -7.25 |
| 1606.625366 | -7.279 |
| 1606.751831 | -7.307 |
| 1606.878296 | -7.335 |
| 1607.004761 | -7.364 |
| 1607.131348 | -7.392 |
| 1607.257813 | -7.42 |
| 1607.384399 | -7.448 |
| 1607.510986 | -7.477 |
| 1607.637573 | -7.505 |
| 1607.76416 | -7.533 |
| 1607.890869 | -7.561 |
| 1608.017456 | -7.589 |
| 1608.144165 | -7.618 |
| 1608.270874 | -7.646 |
| 1608.397705 | -7.674 |
| 1608.524414 | -7.702 |
| 1608.651245 | -7.73 |
| 1608.777954 | -7.758 |
| 1608.904785 | -7.785 |
| 1609.031616 | -7.813 |
| 1609.158447 | -7.841 |
| 1609.285278 | -7.869 |
| 1609.412109 | -7.897 |
| 1609.539063 | -7.925 |
| 1609.666016 | -7.952 |
| 1609.792969 | -7.98 |
| 1609.919922 | -8.008 |
| 1610.046875 | -8.036 |
| 1610.173828 | -8.064 |
| 1610.300903 | -8.091 |
| 1610.427856 | -8.119 |
| 1610.554932 | -8.147 |
| 1610.682129 | -8.175 |
| 1610.809326 | -8.203 |
| 1610.936523 | -8.231 |
| 1611.063599 | -8.259 |
| 1611.190796 | -8.287 |
| 1611.317993 | -8.315 |
| 1611.44519 | -8.343 |
| 1611.572388 | -8.371 |
| 1611.699707 | -8.399 |
| 1611.826904 | -8.428 |
| 1611.954224 | -8.456 |
| 1612.081543 | -8.484 |
| 1612.208862 | -8.513 |
| 1612.336182 | -8.542 |
| 1612.463501 | -8.57 |
| 1612.590942 | -8.599 |
| 1612.718262 | -8.628 |
| 1612.845703 | -8.657 |
| 1612.973145 | -8.686 |
| 1613.100586 | -8.715 |
| 1613.228027 | -8.745 |
| 1613.355591 | -8.774 |
| 1613.483154 | -8.804 |
| 1613.610718 | -8.834 |
| 1613.738281 | -8.864 |
| 1613.865967 | -8.893 |
| 1613.99353 | -8.923 |
| 1614.121094 | -8.954 |
| 1614.248779 | -8.984 |
| 1614.376465 | -9.014 |
| 1614.50415 | -9.044 |
| 1614.631836 | -9.074 |
| 1614.759521 | -9.104 |
| 1614.887329 | -9.134 |
| 1615.015015 | -9.164 |
| 1615.142822 | -9.194 |
| 1615.27063 | -9.224 |
| 1615.398438 | -9.254 |
| 1615.526367 | -9.284 |
| 1615.654175 | -9.314 |
| 1615.782104 | -9.344 |
| 1615.909912 | -9.373 |
| 1616.037842 | -9.403 |
| 1616.166016 | -9.432 |
| 1616.293945 | -9.462 |
| 1616.421875 | -9.492 |
| 1616.549927 | -9.521 |
| 1616.677979 | -9.551 |
| 1616.80603 | -9.581 |
| 1616.934082 | -9.61 |
| 1617.062134 | -9.64 |
| 1617.190308 | -9.67 |
| 1617.318359 | -9.7 |
| 1617.446533 | -9.73 |
| 1617.574707 | -9.76 |
| 1617.702881 | -9.79 |
| 1617.831055 | -9.821 |
| 1617.959351 | -9.851 |
| 1618.087524 | -9.882 |
| 1618.21582 | -9.912 |
| 1618.344116 | -9.943 |
| 1618.472412 | -9.973 |
| 1618.60083 | -10.004 |
| 1618.729248 | -10.035 |
| 1618.857666 | -10.066 |
| 1618.985962 | -10.097 |
| 1619.11438 | -10.128 |
| 1619.24292 | -10.158 |
| 1619.371338 | -10.189 |
| 1619.499756 | -10.22 |
| 1619.628296 | -10.25 |
| 1619.756836 | -10.281 |
| 1619.885376 | -10.311 |
| 1620.013916 | -10.342 |
| 1620.142456 | -10.372 |
| 1620.271118 | -10.402 |
| 1620.399658 | -10.432 |
| 1620.52832 | -10.462 |
| 1620.656982 | -10.492 |
| 1620.785645 | -10.522 |
| 1620.914307 | -10.552 |
| 1621.043091 | -10.581 |
| 1621.171753 | -10.611 |
| 1621.300537 | -10.64 |
| 1621.429443 | -10.67 |
| 1621.558228 | -10.699 |
| 1621.687134 | -10.728 |
| 1621.815918 | -10.758 |
| 1621.944824 | -10.787 |
| 1622.07373 | -10.816 |
| 1622.202637 | -10.846 |
| 1622.331543 | -10.875 |
| 1622.460449 | -10.904 |
| 1622.589355 | -10.934 |
| 1622.718384 | -10.963 |
| 1622.847412 | -10.993 |
| 1622.97644 | -11.022 |
| 1623.105469 | -11.052 |
| 1623.234497 | -11.082 |
| 1623.363647 | -11.112 |
| 1623.492676 | -11.142 |
| 1623.621826 | -11.172 |
| 1623.750977 | -11.202 |
| 1623.880127 | -11.232 |
| 1624.009521 | -11.263 |
| 1624.138672 | -11.293 |
| 1624.267944 | -11.324 |
| 1624.397217 | -11.355 |
| 1624.526489 | -11.386 |
| 1624.655762 | -11.417 |
| 1624.785034 | -11.449 |
| 1624.914429 | -11.48 |
| 1625.043701 | -11.512 |
| 1625.173096 | -11.544 |
| 1625.30249 | -11.576 |
| 1625.431885 | -11.608 |
| 1625.561401 | -11.641 |
| 1625.690796 | -11.673 |
| 1625.820313 | -11.706 |
| 1625.949829 | -11.739 |
| 1626.079346 | -11.771 |
| 1626.208862 | -11.804 |
| 1626.338379 | -11.837 |
| 1626.468018 | -11.869 |
| 1626.597778 | -11.902 |
| 1626.727417 | -11.935 |
| 1626.857056 | -11.967 |
| 1626.986694 | -12 |
| 1627.116333 | -12.032 |
| 1627.246094 | -12.064 |
| 1627.375977 | -12.096 |
| 1627.505615 | -12.128 |
| 1627.635376 | -12.16 |
| 1627.765259 | -12.192 |
| 1627.89502 | -12.223 |
| 1628.024902 | -12.254 |
| 1628.154663 | -12.285 |
| 1628.284546 | -12.316 |
| 1628.414429 | -12.347 |
| 1628.544434 | -12.377 |
| 1628.674316 | -12.408 |
| 1628.804321 | -12.438 |
| 1628.934204 | -12.468 |
| 1629.064209 | -12.498 |
| 1629.194336 | -12.527 |
| 1629.324463 | -12.557 |
| 1629.454468 | -12.586 |
| 1629.584595 | -12.615 |
| 1629.714722 | -12.645 |
| 1629.844727 | -12.673 |
| 1629.974976 | -12.702 |
| 1630.105103 | -12.731 |
| 1630.235229 | -12.76 |
| 1630.365479 | -12.788 |
| 1630.495728 | -12.816 |
| 1630.625977 | -12.845 |
| 1630.756226 | -12.873 |
| 1630.886475 | -12.901 |
| 1631.016846 | -12.929 |
| 1631.147095 | -12.957 |
| 1631.277466 | -12.985 |
| 1631.407837 | -13.013 |
| 1631.538208 | -13.041 |
| 1631.668701 | -13.069 |
| 1631.799072 | -13.097 |
| 1631.929688 | -13.124 |
| 1632.060181 | -13.152 |
| 1632.190674 | -13.18 |
| 1632.321167 | -13.207 |
| 1632.45166 | -13.235 |
| 1632.582275 | -13.263 |
| 1632.712769 | -13.29 |
| 1632.843384 | -13.318 |
| 1632.973999 | -13.345 |
| 1633.104736 | -13.373 |
| 1633.235352 | -13.4 |
| 1633.365967 | -13.428 |
| 1633.496704 | -13.456 |
| 1633.627441 | -13.483 |
| 1633.758179 | -13.511 |
| 1633.888916 | -13.538 |
| 1634.019775 | -13.566 |
| 1634.150513 | -13.593 |
| 1634.281372 | -13.621 |
| 1634.412231 | -13.648 |
| 1634.543213 | -13.675 |
| 1634.674072 | -13.703 |
| 1634.805054 | -13.73 |
| 1634.936035 | -13.756 |
| 1635.066895 | -13.783 |
| 1635.197876 | -13.809 |
| 1635.328857 | -13.836 |
| 1635.459961 | -13.862 |
| 1635.590942 | -13.887 |
| 1635.722046 | -13.913 |
| 1635.853149 | -13.938 |
| 1635.984253 | -13.963 |
| 1636.115356 | -13.988 |
| 1636.24646 | -14.012 |
| 1636.377686 | -14.036 |
| 1636.508789 | -14.06 |
| 1636.640015 | -14.084 |
| 1636.77124 | -14.108 |
| 1636.902466 | -14.131 |
| 1637.033813 | -14.155 |
| 1637.165161 | -14.178 |
| 1637.296509 | -14.201 |
| 1637.427856 | -14.225 |
| 1637.559204 | -14.248 |
| 1637.690552 | -14.271 |
| 1637.822021 | -14.295 |
| 1637.953369 | -14.318 |
| 1638.084839 | -14.342 |
| 1638.216309 | -14.366 |
| 1638.347778 | -14.39 |
| 1638.479248 | -14.413 |
| 1638.61084 | -14.437 |
| 1638.74231 | -14.461 |
| 1638.873901 | -14.485 |
| 1639.005493 | -14.509 |
| 1639.137085 | -14.534 |
| 1639.268677 | -14.558 |
| 1639.400391 | -14.582 |
| 1639.532104 | -14.606 |
| 1639.663696 | -14.63 |
| 1639.79541 | -14.654 |
| 1639.927368 | -14.678 |
| 1640.059082 | -14.703 |
| 1640.190918 | -14.727 |
| 1640.322632 | -14.751 |
| 1640.454468 | -14.774 |
| 1640.586304 | -14.798 |
| 1640.71814 | -14.822 |
| 1640.850098 | -14.846 |
| 1640.981934 | -14.87 |
| 1641.113892 | -14.893 |
| 1641.24585 | -14.917 |
| 1641.377808 | -14.94 |
| 1641.509766 | -14.963 |
| 1641.641846 | -14.986 |
| 1641.773804 | -15.009 |
| 1641.905884 | -15.032 |
| 1642.037964 | -15.055 |
| 1642.170044 | -15.078 |
| 1642.302124 | -15.1 |
| 1642.434326 | -15.122 |
| 1642.56665 | -15.144 |
| 1642.69873 | -15.166 |
| 1642.830933 | -15.188 |
| 1642.963257 | -15.21 |
| 1643.095459 | -15.231 |
| 1643.227661 | -15.253 |
| 1643.359985 | -15.274 |
| 1643.49231 | -15.295 |
| 1643.624634 | -15.316 |
| 1643.756958 | -15.337 |
| 1643.889404 | -15.358 |
| 1644.021729 | -15.378 |
| 1644.154175 | -15.399 |
| 1644.286621 | -15.42 |
| 1644.419189 | -15.441 |
| 1644.551636 | -15.461 |
| 1644.684204 | -15.482 |
| 1644.81665 | -15.503 |
| 1644.949219 | -15.524 |
| 1645.081787 | -15.545 |
| 1645.214478 | -15.566 |
| 1645.347168 | -15.587 |
| 1645.479736 | -15.609 |
| 1645.612427 | -15.63 |
| 1645.745117 | -15.652 |
| 1645.877808 | -15.674 |
| 1646.010498 | -15.696 |
| 1646.143188 | -15.718 |
| 1646.276001 | -15.74 |
| 1646.408813 | -15.763 |
| 1646.541504 | -15.786 |
| 1646.674438 | -15.809 |
| 1646.807251 | -15.832 |
| 1646.940063 | -15.855 |
| 1647.072998 | -15.879 |
| 1647.205933 | -15.903 |
| 1647.338745 | -15.927 |
| 1647.471802 | -15.952 |
| 1647.604736 | -15.976 |
| 1647.737671 | -16.001 |
| 1647.87085 | -16.026 |
| 1648.003906 | -16.051 |
| 1648.136963 | -16.076 |
| 1648.27002 | -16.101 |
| 1648.403076 | -16.125 |
| 1648.536255 | -16.15 |
| 1648.669434 | -16.175 |
| 1648.802612 | -16.199 |
| 1648.935791 | -16.224 |
| 1649.06897 | -16.248 |
| 1649.202148 | -16.272 |
| 1649.335449 | -16.295 |
| 1649.46875 | -16.318 |
| 1649.602051 | -16.341 |
| 1649.735352 | -16.363 |
| 1649.868652 | -16.385 |
| 1650.001953 | -16.406 |
| 1650.135376 | -16.427 |
| 1650.268799 | -16.448 |
| 1650.402222 | -16.468 |
| 1650.535645 | -16.488 |
| 1650.669312 | -16.507 |
| 1650.802734 | -16.526 |
| 1650.936279 | -16.544 |
| 1651.069824 | -16.562 |
| 1651.203369 | -16.58 |
| 1651.336914 | -16.597 |
| 1651.470459 | -16.614 |
| 1651.604126 | -16.63 |
| 1651.737793 | -16.646 |
| 1651.87146 | -16.662 |
| 1652.005127 | -16.677 |
| 1652.138794 | -16.692 |
| 1652.272583 | -16.707 |
| 1652.40625 | -16.722 |
| 1652.540039 | -16.736 |
| 1652.673828 | -16.751 |
| 1652.807617 | -16.765 |
| 1652.941528 | -16.779 |
| 1653.075317 | -16.794 |
| 1653.209229 | -16.808 |
| 1653.343262 | -16.822 |
| 1653.477173 | -16.837 |
| 1653.611084 | -16.852 |
| 1653.745117 | -16.867 |
| 1653.879028 | -16.882 |
| 1654.013062 | -16.898 |
| 1654.147095 | -16.914 |
| 1654.281128 | -16.931 |
| 1654.415283 | -16.949 |
| 1654.549316 | -16.966 |
| 1654.683472 | -16.985 |
| 1654.817627 | -17.004 |
| 1654.951782 | -17.023 |
| 1655.085938 | -17.044 |
| 1655.220093 | -17.064 |
| 1655.35437 | -17.086 |
| 1655.488647 | -17.107 |
| 1655.622803 | -17.129 |
| 1655.757202 | -17.152 |
| 1655.891479 | -17.174 |
| 1656.025879 | -17.197 |
| 1656.160278 | -17.219 |
| 1656.294678 | -17.242 |
| 1656.429077 | -17.264 |
| 1656.563477 | -17.286 |
| 1656.697876 | -17.308 |
| 1656.832397 | -17.329 |
| 1656.966919 | -17.349 |
| 1657.10144 | -17.369 |
| 1657.235962 | -17.388 |
| 1657.370483 | -17.406 |
| 1657.505005 | -17.423 |
| 1657.639648 | -17.439 |
| 1657.774292 | -17.454 |
| 1657.908936 | -17.468 |
| 1658.043579 | -17.481 |
| 1658.178223 | -17.494 |
| 1658.312988 | -17.505 |
| 1658.447632 | -17.516 |
| 1658.582397 | -17.527 |
| 1658.717163 | -17.536 |
| 1658.852173 | -17.546 |
| 1658.986938 | -17.555 |
| 1659.121826 | -17.564 |
| 1659.256592 | -17.573 |
| 1659.391479 | -17.582 |
| 1659.526367 | -17.592 |
| 1659.661377 | -17.601 |
| 1659.796265 | -17.611 |
| 1659.931274 | -17.622 |
| 1660.066284 | -17.633 |
| 1660.201294 | -17.645 |
| 1660.336304 | -17.657 |
| 1660.471313 | -17.67 |
| 1660.606445 | -17.683 |
| 1660.741455 | -17.697 |
| 1660.876587 | -17.712 |
| 1661.011841 | -17.728 |
| 1661.146973 | -17.744 |
| 1661.282104 | -17.761 |
| 1661.417358 | -17.779 |
| 1661.552734 | -17.797 |
| 1661.687988 | -17.816 |
| 1661.823364 | -17.835 |
| 1661.958618 | -17.854 |
| 1662.093994 | -17.875 |
| 1662.22937 | -17.895 |
| 1662.364746 | -17.916 |
| 1662.500122 | -17.937 |
| 1662.635498 | -17.959 |
| 1662.770874 | -17.981 |
| 1662.906372 | -18.003 |
| 1663.04187 | -18.025 |
| 1663.177368 | -18.048 |
| 1663.312866 | -18.07 |
| 1663.448364 | -18.093 |
| 1663.583984 | -18.116 |
| 1663.719604 | -18.139 |
| 1663.855103 | -18.162 |
| 1663.990845 | -18.185 |
| 1664.126465 | -18.208 |
| 1664.262207 | -18.231 |
| 1664.397949 | -18.254 |
| 1664.533691 | -18.277 |
| 1664.669434 | -18.3 |
| 1664.805176 | -18.323 |
| 1664.940918 | -18.345 |
| 1665.076782 | -18.368 |
| 1665.212524 | -18.39 |
| 1665.348389 | -18.412 |
| 1665.484253 | -18.433 |
| 1665.620239 | -18.454 |
| 1665.756104 | -18.475 |
| 1665.89209 | -18.495 |
| 1666.028076 | -18.515 |
| 1666.16394 | -18.534 |
| 1666.300049 | -18.553 |
| 1666.436035 | -18.571 |
| 1666.572021 | -18.589 |
| 1666.70813 | -18.607 |
| 1666.844238 | -18.624 |
| 1666.980469 | -18.641 |
| 1667.116699 | -18.657 |
| 1667.252808 | -18.673 |
| 1667.389038 | -18.689 |
| 1667.525146 | -18.705 |
| 1667.661377 | -18.72 |
| 1667.797729 | -18.736 |
| 1667.93396 | -18.751 |
| 1668.07019 | -18.767 |
| 1668.206543 | -18.782 |
| 1668.342896 | -18.798 |
| 1668.479248 | -18.814 |
| 1668.615601 | -18.83 |
| 1668.752075 | -18.847 |
| 1668.888428 | -18.863 |
| 1669.024902 | -18.88 |
| 1669.161377 | -18.898 |
| 1669.297852 | -18.916 |
| 1669.434448 | -18.934 |
| 1669.570923 | -18.952 |
| 1669.70752 | -18.971 |
| 1669.844238 | -18.99 |
| 1669.980835 | -19.009 |
| 1670.117432 | -19.028 |
| 1670.25415 | -19.048 |
| 1670.390747 | -19.067 |
| 1670.527466 | -19.087 |
| 1670.664185 | -19.107 |
| 1670.800903 | -19.126 |
| 1670.937744 | -19.146 |
| 1671.074463 | -19.166 |
| 1671.211304 | -19.185 |
| 1671.348145 | -19.205 |
| 1671.484985 | -19.224 |
| 1671.621826 | -19.244 |
| 1671.758789 | -19.263 |
| 1671.89563 | -19.282 |
| 1672.032593 | -19.301 |
| 1672.169556 | -19.32 |
| 1672.306641 | -19.339 |
| 1672.443604 | -19.358 |
| 1672.580811 | -19.376 |
| 1672.717773 | -19.395 |
| 1672.854858 | -19.413 |
| 1672.991943 | -19.431 |
| 1673.12915 | -19.449 |
| 1673.266235 | -19.467 |
| 1673.403442 | -19.485 |
| 1673.540649 | -19.503 |
| 1673.677856 | -19.521 |
| 1673.815063 | -19.538 |
| 1673.952271 | -19.556 |
| 1674.0896 | -19.574 |
| 1674.226929 | -19.591 |
| 1674.364258 | -19.609 |
| 1674.501587 | -19.627 |
| 1674.638916 | -19.645 |
| 1674.776367 | -19.663 |
| 1674.913818 | -19.682 |
| 1675.051147 | -19.701 |
| 1675.188721 | -19.72 |
| 1675.326294 | -19.74 |
| 1675.463745 | -19.76 |
| 1675.601318 | -19.78 |
| 1675.738892 | -19.801 |
| 1675.876465 | -19.822 |
| 1676.014038 | -19.844 |
| 1676.151611 | -19.866 |
| 1676.289307 | -19.888 |
| 1676.427002 | -19.911 |
| 1676.564697 | -19.934 |
| 1676.702393 | -19.956 |
| 1676.840088 | -19.979 |
| 1676.977783 | -20.002 |
| 1677.115601 | -20.024 |
| 1677.253418 | -20.047 |
| 1677.391235 | -20.069 |
| 1677.529053 | -20.09 |
| 1677.666992 | -20.112 |
| 1677.80481 | -20.132 |
| 1677.942749 | -20.153 |
| 1678.080811 | -20.173 |
| 1678.21875 | -20.192 |
| 1678.356812 | -20.21 |
| 1678.494751 | -20.229 |
| 1678.632813 | -20.246 |
| 1678.770874 | -20.264 |
| 1678.908936 | -20.28 |
| 1679.046997 | -20.297 |
| 1679.185181 | -20.313 |
| 1679.323242 | -20.329 |
| 1679.461426 | -20.345 |
| 1679.599731 | -20.36 |
| 1679.737915 | -20.376 |
| 1679.876221 | -20.392 |
| 1680.014404 | -20.408 |
| 1680.15271 | -20.425 |
| 1680.291016 | -20.441 |
| 1680.429321 | -20.459 |
| 1680.567749 | -20.476 |
| 1680.706055 | -20.495 |
| 1680.844482 | -20.513 |
| 1680.983032 | -20.533 |
| 1681.12146 | -20.553 |
| 1681.259888 | -20.574 |
| 1681.398315 | -20.595 |
| 1681.536865 | -20.616 |
| 1681.675415 | -20.638 |
| 1681.813965 | -20.661 |
| 1681.952515 | -20.683 |
| 1682.091064 | -20.706 |
| 1682.229736 | -20.729 |
| 1682.368408 | -20.752 |
| 1682.50708 | -20.774 |
| 1682.645752 | -20.797 |
| 1682.784424 | -20.819 |
| 1682.923218 | -20.841 |
| 1683.06189 | -20.862 |
| 1683.200684 | -20.883 |
| 1683.339478 | -20.904 |
| 1683.478394 | -20.924 |
| 1683.617188 | -20.944 |
| 1683.756226 | -20.963 |
| 1683.895142 | -20.982 |
| 1684.034058 | -21.001 |
| 1684.172974 | -21.021 |
| 1684.31189 | -21.04 |
| 1684.450928 | -21.06 |
| 1684.589844 | -21.08 |
| 1684.728882 | -21.1 |
| 1684.86792 | -21.122 |
| 1685.00708 | -21.144 |
| 1685.146118 | -21.167 |
| 1685.285278 | -21.191 |
| 1685.424438 | -21.217 |
| 1685.563599 | -21.243 |
| 1685.702759 | -21.271 |
| 1685.842041 | -21.299 |
| 1685.981201 | -21.329 |
| 1686.120483 | -21.36 |
| 1686.259766 | -21.392 |
| 1686.399048 | -21.424 |
| 1686.538574 | -21.457 |
| 1686.677856 | -21.491 |
| 1686.817261 | -21.524 |
| 1686.956665 | -21.558 |
| 1687.096069 | -21.592 |
| 1687.235596 | -21.625 |
| 1687.375 | -21.658 |
| 1687.514526 | -21.691 |
| 1687.654053 | -21.723 |
| 1687.793579 | -21.754 |
| 1687.933105 | -21.784 |
| 1688.072754 | -21.813 |
| 1688.21228 | -21.842 |
| 1688.351929 | -21.869 |
| 1688.491577 | -21.896 |
| 1688.631226 | -21.921 |
| 1688.770996 | -21.946 |
| 1688.910645 | -21.97 |
| 1689.050415 | -21.994 |
| 1689.190186 | -22.016 |
| 1689.330078 | -22.039 |
| 1689.469971 | -22.06 |
| 1689.609741 | -22.082 |
| 1689.749634 | -22.103 |
| 1689.889526 | -22.124 |
| 1690.029419 | -22.145 |
| 1690.169312 | -22.166 |
| 1690.309326 | -22.188 |
| 1690.449341 | -22.209 |
| 1690.589233 | -22.231 |
| 1690.729248 | -22.253 |
| 1690.869385 | -22.276 |
| 1691.009399 | -22.299 |
| 1691.149536 | -22.323 |
| 1691.289673 | -22.348 |
| 1691.42981 | -22.373 |
| 1691.569946 | -22.4 |
| 1691.710083 | -22.428 |
| 1691.850342 | -22.456 |
| 1691.990601 | -22.486 |
| 1692.130859 | -22.517 |
| 1692.27124 | -22.55 |
| 1692.411499 | -22.583 |
| 1692.55188 | -22.618 |
| 1692.692139 | -22.654 |
| 1692.83252 | -22.692 |
| 1692.973022 | -22.73 |
| 1693.113403 | -22.769 |
| 1693.253784 | -22.81 |
| 1693.394287 | -22.851 |
| 1693.53479 | -22.892 |
| 1693.675293 | -22.934 |
| 1693.815796 | -22.977 |
| 1693.956421 | -23.019 |
| 1694.096924 | -23.061 |
| 1694.237549 | -23.103 |
| 1694.378174 | -23.145 |
| 1694.518799 | -23.185 |
| 1694.659546 | -23.225 |
| 1694.800171 | -23.265 |
| 1694.940918 | -23.303 |
| 1695.081787 | -23.34 |
| 1695.222534 | -23.376 |
| 1695.363403 | -23.411 |
| 1695.50415 | -23.445 |
| 1695.64502 | -23.478 |
| 1695.785889 | -23.51 |
| 1695.926758 | -23.541 |
| 1696.067627 | -23.572 |
| 1696.208618 | -23.602 |
| 1696.349609 | -23.632 |
| 1696.490601 | -23.661 |
| 1696.631592 | -23.691 |
| 1696.772583 | -23.721 |
| 1696.913574 | -23.75 |
| 1697.054688 | -23.781 |
| 1697.195801 | -23.811 |
| 1697.336914 | -23.842 |
| 1697.478027 | -23.874 |
| 1697.619263 | -23.906 |
| 1697.760498 | -23.939 |
| 1697.901855 | -23.972 |
| 1698.043091 | -24.005 |
| 1698.184448 | -24.038 |
| 1698.325684 | -24.072 |
| 1698.467041 | -24.105 |
| 1698.608276 | -24.138 |
| 1698.749634 | -24.17 |
| 1698.891113 | -24.202 |
| 1699.032471 | -24.233 |
| 1699.173828 | -24.262 |
| 1699.315308 | -24.29 |
| 1699.456787 | -24.317 |
| 1699.598267 | -24.342 |
| 1699.739868 | -24.365 |
| 1699.881348 | -24.386 |
| 1700.022949 | -24.406 |
| 1700.164551 | -24.422 |
| 1700.306152 | -24.437 |
| 1700.447754 | -24.45 |
| 1700.589478 | -24.46 |
| 1700.731201 | -24.468 |
| 1700.872925 | -24.473 |
| 1701.014648 | -24.477 |
| 1701.156494 | -24.478 |
| 1701.298218 | -24.478 |
| 1701.440063 | -24.476 |
| 1701.581909 | -24.472 |
| 1701.723755 | -24.467 |
| 1701.865601 | -24.461 |
| 1702.007446 | -24.454 |
| 1702.149414 | -24.446 |
| 1702.291382 | -24.438 |
| 1702.43335 | -24.43 |
| 1702.575317 | -24.421 |
| 1702.717285 | -24.414 |
| 1702.859375 | -24.407 |
| 1703.001465 | -24.4 |
| 1703.143555 | -24.395 |
| 1703.285645 | -24.391 |
| 1703.427734 | -24.389 |
| 1703.569946 | -24.389 |
| 1703.71228 | -24.39 |
| 1703.85437 | -24.394 |
| 1703.996704 | -24.399 |
| 1704.138916 | -24.407 |
| 1704.281128 | -24.416 |
| 1704.423462 | -24.428 |
| 1704.565796 | -24.442 |
| 1704.70813 | -24.459 |
| 1704.850586 | -24.477 |
| 1704.99292 | -24.496 |
| 1705.135376 | -24.517 |
| 1705.277832 | -24.54 |
| 1705.420288 | -24.564 |
| 1705.562744 | -24.588 |
| 1705.7052 | -24.613 |
| 1705.847778 | -24.638 |
| 1705.990356 | -24.664 |
| 1706.132935 | -24.688 |
| 1706.275513 | -24.712 |
| 1706.418213 | -24.735 |
| 1706.561035 | -24.757 |
| 1706.703613 | -24.778 |
| 1706.846313 | -24.797 |
| 1706.989136 | -24.815 |
| 1707.131836 | -24.83 |
| 1707.274658 | -24.844 |
| 1707.41748 | -24.857 |
| 1707.560303 | -24.868 |
| 1707.703125 | -24.877 |
| 1707.845947 | -24.886 |
| 1707.988892 | -24.893 |
| 1708.131836 | -24.9 |
| 1708.27478 | -24.907 |
| 1708.417725 | -24.914 |
| 1708.560669 | -24.921 |
| 1708.703735 | -24.929 |
| 1708.846802 | -24.938 |
| 1708.989746 | -24.948 |
| 1709.132935 | -24.959 |
| 1709.276001 | -24.972 |
| 1709.419312 | -24.987 |
| 1709.5625 | -25.004 |
| 1709.705566 | -25.023 |
| 1709.848877 | -25.044 |
| 1709.992065 | -25.066 |
| 1710.135376 | -25.091 |
| 1710.278564 | -25.117 |
| 1710.421875 | -25.145 |
| 1710.565186 | -25.173 |
| 1710.708618 | -25.203 |
| 1710.851929 | -25.234 |
| 1710.995361 | -25.266 |
| 1711.138794 | -25.298 |
| 1711.282227 | -25.331 |
| 1711.425659 | -25.364 |
| 1711.569214 | -25.397 |
| 1711.712769 | -25.429 |
| 1711.856201 | -25.462 |
| 1711.999878 | -25.494 |
| 1712.143433 | -25.527 |
| 1712.287231 | -25.559 |
| 1712.430786 | -25.59 |
| 1712.574463 | -25.622 |
| 1712.71814 | -25.653 |
| 1712.861938 | -25.684 |
| 1713.005615 | -25.715 |
| 1713.149414 | -25.745 |
| 1713.293213 | -25.776 |
| 1713.437012 | -25.805 |
| 1713.580811 | -25.835 |
| 1713.724609 | -25.864 |
| 1713.86853 | -25.892 |
| 1714.012451 | -25.92 |
| 1714.156372 | -25.947 |
| 1714.300293 | -25.973 |
| 1714.444336 | -25.999 |
| 1714.588257 | -26.024 |
| 1714.7323 | -26.047 |
| 1714.876343 | -26.07 |
| 1715.020508 | -26.092 |
| 1715.164673 | -26.114 |
| 1715.308838 | -26.135 |
| 1715.453003 | -26.155 |
| 1715.597168 | -26.174 |
| 1715.741333 | -26.194 |
| 1715.88562 | -26.213 |
| 1716.029785 | -26.232 |
| 1716.174072 | -26.251 |
| 1716.318481 | -26.27 |
| 1716.462891 | -26.289 |
| 1716.607178 | -26.309 |
| 1716.751587 | -26.328 |
| 1716.895874 | -26.348 |
| 1717.040405 | -26.369 |
| 1717.184814 | -26.389 |
| 1717.329224 | -26.41 |
| 1717.473755 | -26.43 |
| 1717.618286 | -26.451 |
| 1717.762817 | -26.471 |
| 1717.907349 | -26.491 |
| 1718.05188 | -26.511 |
| 1718.196655 | -26.53 |
| 1718.341309 | -26.548 |
| 1718.485962 | -26.566 |
| 1718.630615 | -26.582 |
| 1718.775391 | -26.597 |
| 1718.920044 | -26.611 |
| 1719.064819 | -26.623 |
| 1719.209595 | -26.633 |
| 1719.35437 | -26.641 |
| 1719.499268 | -26.648 |
| 1719.644165 | -26.652 |
| 1719.78894 | -26.653 |
| 1719.933838 | -26.652 |
| 1720.078857 | -26.649 |
| 1720.223755 | -26.643 |
| 1720.368774 | -26.635 |
| 1720.513794 | -26.624 |
| 1720.658813 | -26.611 |
| 1720.803833 | -26.596 |
| 1720.948853 | -26.579 |
| 1721.094116 | -26.561 |
| 1721.239258 | -26.541 |
| 1721.384399 | -26.521 |
| 1721.529541 | -26.5 |
| 1721.674805 | -26.479 |
| 1721.819946 | -26.458 |
| 1721.96521 | -26.438 |
| 1722.110474 | -26.418 |
| 1722.255737 | -26.401 |
| 1722.401123 | -26.385 |
| 1722.546387 | -26.371 |
| 1722.691772 | -26.359 |
| 1722.837158 | -26.35 |
| 1722.982666 | -26.344 |
| 1723.128052 | -26.341 |
| 1723.27356 | -26.34 |
| 1723.419067 | -26.343 |
| 1723.564575 | -26.348 |
| 1723.710083 | -26.357 |
| 1723.855591 | -26.368 |
| 1724.001343 | -26.382 |
| 1724.146973 | -26.399 |
| 1724.292603 | -26.418 |
| 1724.438232 | -26.439 |
| 1724.583984 | -26.461 |
| 1724.729614 | -26.485 |
| 1724.875366 | -26.51 |
| 1725.021118 | -26.535 |
| 1725.166992 | -26.559 |
| 1725.312744 | -26.584 |
| 1725.458618 | -26.607 |
| 1725.604492 | -26.628 |
| 1725.750366 | -26.647 |
| 1725.89624 | -26.664 |
| 1726.042114 | -26.678 |
| 1726.18811 | -26.69 |
| 1726.334106 | -26.697 |
| 1726.480103 | -26.702 |
| 1726.626099 | -26.703 |
| 1726.772217 | -26.701 |
| 1726.918457 | -26.695 |
| 1727.064575 | -26.687 |
| 1727.210693 | -26.676 |
| 1727.356812 | -26.663 |
| 1727.503052 | -26.648 |
| 1727.64917 | -26.631 |
| 1727.79541 | -26.615 |
| 1727.94165 | -26.597 |
| 1728.088013 | -26.58 |
| 1728.234253 | -26.564 |
| 1728.380615 | -26.549 |
| 1728.526978 | -26.535 |
| 1728.67334 | -26.523 |
| 1728.819702 | -26.514 |
| 1728.966187 | -26.507 |
| 1729.112549 | -26.503 |
| 1729.259033 | -26.503 |
| 1729.40564 | -26.505 |
| 1729.552124 | -26.511 |
| 1729.698608 | -26.52 |
| 1729.845215 | -26.533 |
| 1729.991943 | -26.549 |
| 1730.138672 | -26.568 |
| 1730.285278 | -26.591 |
| 1730.431885 | -26.617 |
| 1730.578613 | -26.645 |
| 1730.725342 | -26.677 |
| 1730.87207 | -26.711 |
| 1731.018921 | -26.748 |
| 1731.165649 | -26.786 |
| 1731.3125 | -26.826 |
| 1731.459351 | -26.868 |
| 1731.606201 | -26.911 |
| 1731.753174 | -26.955 |
| 1731.900024 | -26.999 |
| 1732.046997 | -27.043 |
| 1732.19397 | -27.087 |
| 1732.340942 | -27.131 |
| 1732.488037 | -27.173 |
| 1732.63501 | -27.215 |
| 1732.782104 | -27.255 |
| 1732.929443 | -27.294 |
| 1733.076538 | -27.331 |
| 1733.223633 | -27.365 |
| 1733.37085 | -27.397 |
| 1733.518066 | -27.427 |
| 1733.665283 | -27.454 |
| 1733.8125 | -27.478 |
| 1733.959839 | -27.499 |
| 1734.107056 | -27.517 |
| 1734.254395 | -27.531 |
| 1734.401733 | -27.542 |
| 1734.549072 | -27.549 |
| 1734.696533 | -27.554 |
| 1734.843994 | -27.555 |
| 1734.991455 | -27.552 |
| 1735.138916 | -27.547 |
| 1735.286499 | -27.539 |
| 1735.434082 | -27.528 |
| 1735.581543 | -27.516 |
| 1735.729126 | -27.501 |
| 1735.876953 | -27.486 |
| 1736.024536 | -27.47 |
| 1736.172241 | -27.453 |
| 1736.319824 | -27.438 |
| 1736.467529 | -27.423 |
| 1736.615356 | -27.409 |
| 1736.763062 | -27.398 |
| 1736.910767 | -27.389 |
| 1737.058594 | -27.382 |
| 1737.206421 | -27.379 |
| 1737.354248 | -27.38 |
| 1737.502197 | -27.384 |
| 1737.650024 | -27.392 |
| 1737.797974 | -27.404 |
| 1737.945923 | -27.42 |
| 1738.093994 | -27.439 |
| 1738.241943 | -27.462 |
| 1738.390015 | -27.488 |
| 1738.537964 | -27.517 |
| 1738.686157 | -27.548 |
| 1738.834351 | -27.581 |
| 1738.982422 | -27.615 |
| 1739.130615 | -27.65 |
| 1739.278809 | -27.685 |
| 1739.427002 | -27.719 |
| 1739.575195 | -27.753 |
| 1739.723511 | -27.785 |
| 1739.871826 | -27.815 |
| 1740.020142 | -27.843 |
| 1740.168457 | -27.868 |
| 1740.316772 | -27.89 |
| 1740.46521 | -27.91 |
| 1740.613525 | -27.927 |
| 1740.761963 | -27.941 |
| 1740.9104 | -27.953 |
| 1741.05896 | -27.963 |
| 1741.207397 | -27.971 |
| 1741.355957 | -27.979 |
| 1741.504517 | -27.985 |
| 1741.653076 | -27.992 |
| 1741.80188 | -27.999 |
| 1741.950562 | -28.007 |
| 1742.099121 | -28.017 |
| 1742.247803 | -28.029 |
| 1742.396606 | -28.043 |
| 1742.545288 | -28.06 |
| 1742.694092 | -28.08 |
| 1742.842896 | -28.104 |
| 1742.991699 | -28.13 |
| 1743.140503 | -28.159 |
| 1743.289429 | -28.192 |
| 1743.438232 | -28.227 |
| 1743.587158 | -28.265 |
| 1743.736084 | -28.304 |
| 1743.885132 | -28.345 |
| 1744.034058 | -28.388 |
| 1744.183105 | -28.43 |
| 1744.332153 | -28.472 |
| 1744.481201 | -28.513 |
| 1744.630249 | -28.553 |
| 1744.779419 | -28.591 |
| 1744.928711 | -28.626 |
| 1745.077881 | -28.658 |
| 1745.227051 | -28.686 |
| 1745.376221 | -28.71 |
| 1745.525513 | -28.731 |
| 1745.674805 | -28.747 |
| 1745.824097 | -28.759 |
| 1745.973389 | -28.767 |
| 1746.122803 | -28.77 |
| 1746.272095 | -28.77 |
| 1746.421509 | -28.767 |
| 1746.570923 | -28.76 |
| 1746.720459 | -28.75 |
| 1746.869873 | -28.738 |
| 1747.019409 | -28.723 |
| 1747.168945 | -28.707 |
| 1747.318481 | -28.689 |
| 1747.468018 | -28.67 |
| 1747.617676 | -28.649 |
| 1747.767212 | -28.628 |
| 1747.917114 | -28.607 |
| 1748.066772 | -28.586 |
| 1748.216431 | -28.564 |
| 1748.366211 | -28.543 |
| 1748.515991 | -28.522 |
| 1748.665771 | -28.502 |
| 1748.815552 | -28.483 |
| 1748.965332 | -28.465 |
| 1749.115234 | -28.448 |
| 1749.265137 | -28.433 |
| 1749.415039 | -28.419 |
| 1749.564941 | -28.407 |
| 1749.714966 | -28.398 |
| 1749.864868 | -28.39 |
| 1750.014893 | -28.385 |
| 1750.164917 | -28.382 |
| 1750.315063 | -28.381 |
| 1750.465088 | -28.383 |
| 1750.615234 | -28.386 |
| 1750.765381 | -28.392 |
| 1750.915771 | -28.399 |
| 1751.065918 | -28.408 |
| 1751.216187 | -28.418 |
| 1751.366333 | -28.429 |
| 1751.516602 | -28.44 |
| 1751.666992 | -28.452 |
| 1751.817261 | -28.464 |
| 1751.967651 | -28.475 |
| 1752.118042 | -28.486 |
| 1752.268433 | -28.496 |
| 1752.418823 | -28.505 |
| 1752.569214 | -28.513 |
| 1752.719727 | -28.52 |
| 1752.870239 | -28.526 |
| 1753.020752 | -28.531 |
| 1753.171387 | -28.535 |
| 1753.321899 | -28.538 |
| 1753.472534 | -28.541 |
| 1753.623169 | -28.544 |
| 1753.773804 | -28.546 |
| 1753.924683 | -28.549 |
| 1754.075317 | -28.553 |
| 1754.226074 | -28.557 |
| 1754.376831 | -28.562 |
| 1754.52771 | -28.568 |
| 1754.678589 | -28.575 |
| 1754.829468 | -28.583 |
| 1754.980347 | -28.592 |
| 1755.131226 | -28.602 |
| 1755.282104 | -28.613 |
| 1755.433105 | -28.624 |
| 1755.584106 | -28.636 |
| 1755.735107 | -28.649 |
| 1755.886108 | -28.661 |
| 1756.037109 | -28.674 |
| 1756.188232 | -28.686 |
| 1756.339233 | -28.698 |
| 1756.490479 | -28.708 |
| 1756.641602 | -28.718 |
| 1756.792725 | -28.727 |
| 1756.944092 | -28.734 |
| 1757.095337 | -28.739 |
| 1757.246582 | -28.743 |
| 1757.397827 | -28.746 |
| 1757.549194 | -28.746 |
| 1757.700562 | -28.744 |
| 1757.851929 | -28.741 |
| 1758.003296 | -28.735 |
| 1758.154663 | -28.727 |
| 1758.306152 | -28.718 |
| 1758.457642 | -28.707 |
| 1758.609131 | -28.694 |
| 1758.76062 | -28.679 |
| 1758.912109 | -28.663 |
| 1759.063721 | -28.646 |
| 1759.215332 | -28.628 |
| 1759.366943 | -28.61 |
| 1759.518555 | -28.591 |
| 1759.670288 | -28.572 |
| 1759.821899 | -28.553 |
| 1759.973633 | -28.535 |
| 1760.12561 | -28.518 |
| 1760.277344 | -28.502 |
| 1760.429199 | -28.487 |
| 1760.580933 | -28.473 |
| 1760.732788 | -28.462 |
| 1760.884766 | -28.451 |
| 1761.036621 | -28.443 |
| 1761.188599 | -28.436 |
| 1761.340576 | -28.431 |
| 1761.492554 | -28.427 |
| 1761.644531 | -28.424 |
| 1761.796631 | -28.422 |
| 1761.948608 | -28.421 |
| 1762.100708 | -28.42 |
| 1762.252808 | -28.419 |
| 1762.405029 | -28.417 |
| 1762.557129 | -28.416 |
| 1762.709351 | -28.413 |
| 1762.861572 | -28.41 |
| 1763.013794 | -28.405 |
| 1763.16626 | -28.4 |
| 1763.318604 | -28.394 |
| 1763.470947 | -28.387 |
| 1763.623291 | -28.378 |
| 1763.775635 | -28.37 |
| 1763.928101 | -28.36 |
| 1764.080444 | -28.351 |
| 1764.23291 | -28.342 |
| 1764.385498 | -28.332 |
| 1764.537964 | -28.324 |
| 1764.690552 | -28.316 |
| 1764.843018 | -28.309 |
| 1764.995605 | -28.302 |
| 1765.148315 | -28.297 |
| 1765.300903 | -28.294 |
| 1765.453613 | -28.291 |
| 1765.606323 | -28.29 |
| 1765.759033 | -28.29 |
| 1765.911743 | -28.292 |
| 1766.064575 | -28.295 |
| 1766.217529 | -28.299 |
| 1766.370361 | -28.305 |
| 1766.523193 | -28.312 |
| 1766.676025 | -28.322 |
| 1766.828979 | -28.333 |
| 1766.981934 | -28.346 |
| 1767.134888 | -28.361 |
| 1767.287842 | -28.379 |
| 1767.440918 | -28.399 |
| 1767.593994 | -28.422 |
| 1767.74707 | -28.448 |
| 1767.900146 | -28.478 |
| 1768.053223 | -28.511 |
| 1768.206421 | -28.546 |
| 1768.359497 | -28.585 |
| 1768.512817 | -28.628 |
| 1768.666016 | -28.672 |
| 1768.819214 | -28.719 |
| 1768.972534 | -28.768 |
| 1769.125854 | -28.818 |
| 1769.279297 | -28.869 |
| 1769.432739 | -28.919 |
| 1769.58606 | -28.968 |
| 1769.739502 | -29.014 |
| 1769.892944 | -29.058 |
| 1770.046387 | -29.097 |
| 1770.199829 | -29.132 |
| 1770.353394 | -29.16 |
| 1770.506958 | -29.183 |
| 1770.660522 | -29.198 |
| 1770.814087 | -29.207 |
| 1770.967773 | -29.208 |
| 1771.12146 | -29.203 |
| 1771.275146 | -29.191 |
| 1771.428833 | -29.172 |
| 1771.58252 | -29.149 |
| 1771.736328 | -29.12 |
| 1771.890137 | -29.088 |
| 1772.043945 | -29.054 |
| 1772.197754 | -29.018 |
| 1772.351807 | -28.981 |
| 1772.505615 | -28.945 |
| 1772.659546 | -28.91 |
| 1772.813477 | -28.877 |
| 1772.967529 | -28.848 |
| 1773.12146 | -28.822 |
| 1773.275513 | -28.8 |
| 1773.429565 | -28.782 |
| 1773.583618 | -28.769 |
| 1773.737793 | -28.761 |
| 1773.891968 | -28.758 |
| 1774.046021 | -28.759 |
| 1774.200317 | -28.765 |
| 1774.354492 | -28.776 |
| 1774.508911 | -28.79 |
| 1774.663086 | -28.807 |
| 1774.817383 | -28.827 |
| 1774.971802 | -28.849 |
| 1775.126099 | -28.873 |
| 1775.280518 | -28.898 |
| 1775.434937 | -28.923 |
| 1775.589478 | -28.947 |
| 1775.743896 | -28.97 |
| 1775.898438 | -28.992 |
| 1776.052979 | -29.011 |
| 1776.20752 | -29.028 |
| 1776.362061 | -29.041 |
| 1776.516602 | -29.05 |
| 1776.671265 | -29.055 |
| 1776.825928 | -29.057 |
| 1776.980591 | -29.054 |
| 1777.135254 | -29.046 |
| 1777.290039 | -29.035 |
| 1777.444702 | -29.019 |
| 1777.599487 | -29 |
| 1777.754272 | -28.977 |
| 1777.90918 | -28.952 |
| 1778.064087 | -28.924 |
| 1778.218872 | -28.895 |
| 1778.373779 | -28.864 |
| 1778.528809 | -28.833 |
| 1778.683838 | -28.803 |
| 1778.838867 | -28.773 |
| 1778.993896 | -28.745 |
| 1779.148926 | -28.72 |
| 1779.304077 | -28.697 |
| 1779.459106 | -28.678 |
| 1779.614258 | -28.663 |
| 1779.769409 | -28.652 |
| 1779.924683 | -28.646 |
| 1780.079834 | -28.645 |
| 1780.235107 | -28.65 |
| 1780.390381 | -28.659 |
| 1780.545654 | -28.674 |
| 1780.700928 | -28.693 |
| 1780.856323 | -28.717 |
| 1781.011719 | -28.744 |
| 1781.167114 | -28.776 |
| 1781.32251 | -28.81 |
| 1781.478027 | -28.846 |
| 1781.633423 | -28.883 |
| 1781.789063 | -28.921 |
| 1781.944702 | -28.958 |
| 1782.10022 | -28.993 |
| 1782.255859 | -29.026 |
| 1782.411377 | -29.055 |
| 1782.567139 | -29.08 |
| 1782.722778 | -29.1 |
| 1782.878418 | -29.115 |
| 1783.03418 | -29.124 |
| 1783.189941 | -29.126 |
| 1783.345703 | -29.123 |
| 1783.501587 | -29.113 |
| 1783.657349 | -29.097 |
| 1783.813232 | -29.076 |
| 1783.969116 | -29.05 |
| 1784.125 | -29.02 |
| 1784.281006 | -28.987 |
| 1784.437012 | -28.951 |
| 1784.593018 | -28.913 |
| 1784.749023 | -28.875 |
| 1784.905151 | -28.836 |
| 1785.061279 | -28.798 |
| 1785.217407 | -28.761 |
| 1785.373535 | -28.726 |
| 1785.529663 | -28.694 |
| 1785.685913 | -28.665 |
| 1785.842163 | -28.639 |
| 1785.998413 | -28.616 |
| 1786.154663 | -28.598 |
| 1786.310913 | -28.583 |
| 1786.467285 | -28.572 |
| 1786.623657 | -28.565 |
| 1786.780029 | -28.562 |
| 1786.936401 | -28.562 |
| 1787.092896 | -28.565 |
| 1787.249268 | -28.571 |
| 1787.405762 | -28.579 |
| 1787.562378 | -28.589 |
| 1787.718872 | -28.6 |
| 1787.875488 | -28.612 |
| 1788.032227 | -28.624 |
| 1788.188843 | -28.636 |
| 1788.345459 | -28.646 |
| 1788.502197 | -28.655 |
| 1788.658936 | -28.662 |
| 1788.815674 | -28.666 |
| 1788.972412 | -28.667 |
| 1789.12915 | -28.664 |
| 1789.286011 | -28.659 |
| 1789.442871 | -28.649 |
| 1789.599731 | -28.636 |
| 1789.756592 | -28.62 |
| 1789.913574 | -28.6 |
| 1790.070557 | -28.577 |
| 1790.227539 | -28.551 |
| 1790.384521 | -28.523 |
| 1790.541626 | -28.493 |
| 1790.698608 | -28.462 |
| 1790.855713 | -28.429 |
| 1791.012817 | -28.397 |
| 1791.170166 | -28.365 |
| 1791.327393 | -28.333 |
| 1791.484619 | -28.303 |
| 1791.641846 | -28.274 |
| 1791.799072 | -28.246 |
| 1791.956299 | -28.221 |
| 1792.113647 | -28.198 |
| 1792.270996 | -28.178 |
| 1792.428345 | -28.16 |
| 1792.585815 | -28.145 |
| 1792.743286 | -28.132 |
| 1792.900635 | -28.122 |
| 1793.058105 | -28.114 |
| 1793.215698 | -28.108 |
| 1793.373169 | -28.104 |
| 1793.530762 | -28.102 |
| 1793.688354 | -28.101 |
| 1793.845947 | -28.102 |
| 1794.003662 | -28.103 |
| 1794.161377 | -28.105 |
| 1794.319092 | -28.107 |
| 1794.476929 | -28.11 |
| 1794.634644 | -28.112 |
| 1794.792603 | -28.114 |
| 1794.950439 | -28.116 |
| 1795.108276 | -28.118 |
| 1795.266113 | -28.119 |
| 1795.424072 | -28.119 |
| 1795.582031 | -28.12 |
| 1795.73999 | -28.12 |
| 1795.897949 | -28.12 |
| 1796.055908 | -28.119 |
| 1796.213989 | -28.12 |
| 1796.37207 | -28.12 |
| 1796.530151 | -28.122 |
| 1796.688232 | -28.124 |
| 1796.846436 | -28.127 |
| 1797.004639 | -28.132 |
| 1797.162842 | -28.139 |
| 1797.321045 | -28.147 |
| 1797.479248 | -28.157 |
| 1797.637695 | -28.169 |
| 1797.796021 | -28.183 |
| 1797.954346 | -28.198 |
| 1798.112793 | -28.215 |
| 1798.271118 | -28.234 |
| 1798.429565 | -28.253 |
| 1798.588013 | -28.274 |
| 1798.746582 | -28.294 |
| 1798.905029 | -28.315 |
| 1799.063599 | -28.335 |
| 1799.222168 | -28.353 |
| 1799.380737 | -28.37 |
| 1799.539429 | -28.384 |
| 1799.697998 | -28.396 |
| 1799.856689 | -28.405 |
| 1800.015381 | -28.409 |